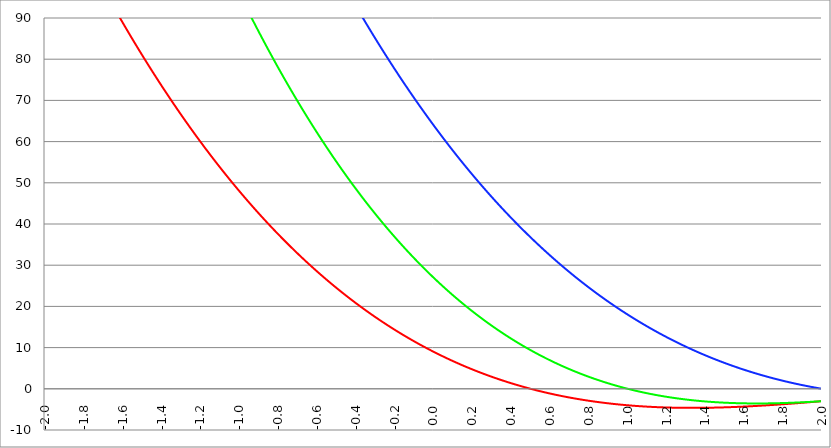
| Category | Series 1 | Series 0 | Series 2 |
|---|---|---|---|
| -2.0 | 125 | 225 | 288 |
| -1.998 | 124.8 | 224.67 | 287.664 |
| -1.996 | 124.6 | 224.341 | 287.329 |
| -1.994 | 124.401 | 224.011 | 286.993 |
| -1.992 | 124.202 | 223.682 | 286.658 |
| -1.99 | 124.002 | 223.354 | 286.323 |
| -1.988 | 123.804 | 223.026 | 285.989 |
| -1.986 | 123.605 | 222.698 | 285.654 |
| -1.984 | 123.406 | 222.37 | 285.32 |
| -1.982 | 123.208 | 222.043 | 284.986 |
| -1.98 | 123.01 | 221.716 | 284.653 |
| -1.978 | 122.812 | 221.389 | 284.319 |
| -1.976 | 122.614 | 221.062 | 283.986 |
| -1.974 | 122.417 | 220.736 | 283.654 |
| -1.972 | 122.22 | 220.411 | 283.321 |
| -1.97 | 122.022 | 220.085 | 282.989 |
| -1.968 | 121.826 | 219.76 | 282.657 |
| -1.966 | 121.629 | 219.435 | 282.325 |
| -1.964 | 121.432 | 219.11 | 281.993 |
| -1.962 | 121.236 | 218.786 | 281.662 |
| -1.96 | 121.04 | 218.462 | 281.331 |
| -1.958 | 120.844 | 218.139 | 281 |
| -1.956 | 120.648 | 217.815 | 280.67 |
| -1.954 | 120.453 | 217.492 | 280.34 |
| -1.952 | 120.257 | 217.17 | 280.01 |
| -1.95 | 120.062 | 216.847 | 279.68 |
| -1.948 | 119.867 | 216.525 | 279.35 |
| -1.946 | 119.673 | 216.203 | 279.021 |
| -1.944 | 119.478 | 215.882 | 278.692 |
| -1.942 | 119.284 | 215.561 | 278.363 |
| -1.94 | 119.09 | 215.24 | 278.035 |
| -1.938 | 118.896 | 214.919 | 277.707 |
| -1.936 | 118.702 | 214.599 | 277.379 |
| -1.934 | 118.508 | 214.279 | 277.051 |
| -1.932 | 118.315 | 213.959 | 276.723 |
| -1.93 | 118.122 | 213.64 | 276.396 |
| -1.928 | 117.929 | 213.321 | 276.069 |
| -1.926 | 117.736 | 213.002 | 275.742 |
| -1.924 | 117.544 | 212.684 | 275.416 |
| -1.922 | 117.351 | 212.366 | 275.09 |
| -1.92 | 117.159 | 212.048 | 274.764 |
| -1.918 | 116.967 | 211.731 | 274.438 |
| -1.916 | 116.775 | 211.413 | 274.113 |
| -1.914 | 116.584 | 211.097 | 273.787 |
| -1.912 | 116.392 | 210.78 | 273.462 |
| -1.91 | 116.201 | 210.464 | 273.138 |
| -1.908 | 116.01 | 210.148 | 272.813 |
| -1.906 | 115.819 | 209.832 | 272.489 |
| -1.904 | 115.629 | 209.517 | 272.165 |
| -1.902 | 115.438 | 209.202 | 271.841 |
| -1.9 | 115.248 | 208.887 | 271.518 |
| -1.898 | 115.058 | 208.573 | 271.195 |
| -1.896 | 114.868 | 208.258 | 270.872 |
| -1.894 | 114.679 | 207.945 | 270.549 |
| -1.892 | 114.489 | 207.631 | 270.227 |
| -1.89 | 114.3 | 207.318 | 269.905 |
| -1.888 | 114.111 | 207.005 | 269.583 |
| -1.886 | 113.922 | 206.692 | 269.261 |
| -1.884 | 113.733 | 206.38 | 268.939 |
| -1.882 | 113.545 | 206.068 | 268.618 |
| -1.88 | 113.357 | 205.756 | 268.297 |
| -1.878 | 113.168 | 205.445 | 267.977 |
| -1.876 | 112.981 | 205.134 | 267.656 |
| -1.874 | 112.793 | 204.823 | 267.336 |
| -1.872 | 112.605 | 204.513 | 267.016 |
| -1.87 | 112.418 | 204.203 | 266.696 |
| -1.868 | 112.231 | 203.893 | 266.377 |
| -1.866 | 112.044 | 203.583 | 266.058 |
| -1.864 | 111.857 | 203.274 | 265.739 |
| -1.862 | 111.671 | 202.965 | 265.42 |
| -1.86 | 111.485 | 202.656 | 265.102 |
| -1.858 | 111.298 | 202.348 | 264.784 |
| -1.856 | 111.112 | 202.04 | 264.466 |
| -1.854 | 110.927 | 201.732 | 264.148 |
| -1.852 | 110.741 | 201.425 | 263.83 |
| -1.85 | 110.556 | 201.117 | 263.513 |
| -1.848 | 110.371 | 200.811 | 263.196 |
| -1.846 | 110.186 | 200.504 | 262.88 |
| -1.844 | 110.001 | 200.198 | 262.563 |
| -1.842 | 109.816 | 199.892 | 262.247 |
| -1.84 | 109.632 | 199.586 | 261.931 |
| -1.838 | 109.448 | 199.281 | 261.615 |
| -1.836 | 109.264 | 198.976 | 261.3 |
| -1.834 | 109.08 | 198.671 | 260.985 |
| -1.832 | 108.896 | 198.367 | 260.67 |
| -1.83 | 108.713 | 198.062 | 260.355 |
| -1.828 | 108.529 | 197.759 | 260.041 |
| -1.826 | 108.346 | 197.455 | 259.726 |
| -1.824 | 108.163 | 197.152 | 259.412 |
| -1.822 | 107.981 | 196.849 | 259.099 |
| -1.82 | 107.798 | 196.546 | 258.785 |
| -1.818 | 107.616 | 196.244 | 258.472 |
| -1.816 | 107.434 | 195.942 | 258.159 |
| -1.814 | 107.252 | 195.64 | 257.846 |
| -1.812 | 107.07 | 195.338 | 257.534 |
| -1.81 | 106.889 | 195.037 | 257.221 |
| -1.808 | 106.707 | 194.736 | 256.909 |
| -1.806 | 106.526 | 194.436 | 256.598 |
| -1.804 | 106.345 | 194.136 | 256.286 |
| -1.802 | 106.165 | 193.836 | 255.975 |
| -1.8 | 105.984 | 193.536 | 255.664 |
| -1.798 | 105.804 | 193.237 | 255.353 |
| -1.796 | 105.623 | 192.938 | 255.043 |
| -1.794 | 105.443 | 192.639 | 254.732 |
| -1.792 | 105.264 | 192.34 | 254.422 |
| -1.79 | 105.084 | 192.042 | 254.113 |
| -1.788 | 104.905 | 191.744 | 253.803 |
| -1.786 | 104.725 | 191.447 | 253.494 |
| -1.784 | 104.546 | 191.149 | 253.185 |
| -1.782 | 104.367 | 190.852 | 252.876 |
| -1.78 | 104.189 | 190.556 | 252.568 |
| -1.778 | 104.01 | 190.259 | 252.259 |
| -1.776 | 103.832 | 189.963 | 251.951 |
| -1.774 | 103.654 | 189.667 | 251.643 |
| -1.772 | 103.476 | 189.372 | 251.336 |
| -1.77 | 103.298 | 189.077 | 251.028 |
| -1.768 | 103.121 | 188.782 | 250.721 |
| -1.766 | 102.943 | 188.487 | 250.415 |
| -1.764 | 102.766 | 188.193 | 250.108 |
| -1.762 | 102.589 | 187.899 | 249.802 |
| -1.76 | 102.412 | 187.605 | 249.496 |
| -1.758 | 102.236 | 187.311 | 249.19 |
| -1.756 | 102.059 | 187.018 | 248.884 |
| -1.754 | 101.883 | 186.725 | 248.579 |
| -1.752 | 101.707 | 186.433 | 248.274 |
| -1.75 | 101.531 | 186.141 | 247.969 |
| -1.748 | 101.356 | 185.849 | 247.664 |
| -1.746 | 101.18 | 185.557 | 247.36 |
| -1.744 | 101.005 | 185.266 | 247.056 |
| -1.742 | 100.83 | 184.974 | 246.752 |
| -1.74 | 100.655 | 184.684 | 246.448 |
| -1.738 | 100.48 | 184.393 | 246.145 |
| -1.736 | 100.306 | 184.103 | 245.841 |
| -1.734 | 100.131 | 183.813 | 245.539 |
| -1.732 | 99.957 | 183.523 | 245.236 |
| -1.73 | 99.783 | 183.234 | 244.933 |
| -1.728 | 99.609 | 182.945 | 244.631 |
| -1.726 | 99.436 | 182.656 | 244.329 |
| -1.724 | 99.262 | 182.368 | 244.028 |
| -1.722 | 99.089 | 182.08 | 243.726 |
| -1.72 | 98.916 | 181.792 | 243.425 |
| -1.718 | 98.743 | 181.504 | 243.124 |
| -1.716 | 98.571 | 181.217 | 242.823 |
| -1.714 | 98.398 | 180.93 | 242.523 |
| -1.712 | 98.226 | 180.643 | 242.222 |
| -1.71 | 98.054 | 180.357 | 241.922 |
| -1.708 | 97.882 | 180.071 | 241.623 |
| -1.706 | 97.71 | 179.785 | 241.323 |
| -1.704 | 97.539 | 179.499 | 241.024 |
| -1.702 | 97.367 | 179.214 | 240.725 |
| -1.7 | 97.196 | 178.929 | 240.426 |
| -1.698 | 97.025 | 178.644 | 240.127 |
| -1.696 | 96.854 | 178.36 | 239.829 |
| -1.694 | 96.684 | 178.076 | 239.531 |
| -1.692 | 96.513 | 177.792 | 239.233 |
| -1.69 | 96.343 | 177.509 | 238.936 |
| -1.688 | 96.173 | 177.225 | 238.638 |
| -1.686 | 96.003 | 176.942 | 238.341 |
| -1.684 | 95.833 | 176.66 | 238.044 |
| -1.682 | 95.664 | 176.377 | 237.748 |
| -1.68 | 95.494 | 176.095 | 237.451 |
| -1.678 | 95.325 | 175.814 | 237.155 |
| -1.676 | 95.156 | 175.532 | 236.859 |
| -1.674 | 94.988 | 175.251 | 236.564 |
| -1.672 | 94.819 | 174.97 | 236.268 |
| -1.67 | 94.651 | 174.689 | 235.973 |
| -1.668 | 94.482 | 174.409 | 235.678 |
| -1.666 | 94.314 | 174.129 | 235.383 |
| -1.664 | 94.147 | 173.849 | 235.089 |
| -1.662 | 93.979 | 173.57 | 234.795 |
| -1.66 | 93.811 | 173.29 | 234.501 |
| -1.658 | 93.644 | 173.012 | 234.207 |
| -1.656 | 93.477 | 172.733 | 233.913 |
| -1.654 | 93.31 | 172.455 | 233.62 |
| -1.652 | 93.143 | 172.177 | 233.327 |
| -1.65 | 92.977 | 171.899 | 233.034 |
| -1.648 | 92.81 | 171.621 | 232.742 |
| -1.646 | 92.644 | 171.344 | 232.449 |
| -1.644 | 92.478 | 171.067 | 232.157 |
| -1.642 | 92.312 | 170.791 | 231.865 |
| -1.64 | 92.147 | 170.514 | 231.574 |
| -1.638 | 91.981 | 170.238 | 231.283 |
| -1.636 | 91.816 | 169.963 | 230.991 |
| -1.634 | 91.651 | 169.687 | 230.701 |
| -1.632 | 91.486 | 169.412 | 230.41 |
| -1.63 | 91.321 | 169.137 | 230.119 |
| -1.628 | 91.157 | 168.863 | 229.829 |
| -1.626 | 90.992 | 168.588 | 229.539 |
| -1.624 | 90.828 | 168.314 | 229.25 |
| -1.622 | 90.664 | 168.04 | 228.96 |
| -1.62 | 90.5 | 167.767 | 228.671 |
| -1.618 | 90.337 | 167.494 | 228.382 |
| -1.616 | 90.173 | 167.221 | 228.093 |
| -1.614 | 90.01 | 166.948 | 227.805 |
| -1.612 | 89.847 | 166.676 | 227.517 |
| -1.61 | 89.684 | 166.404 | 227.229 |
| -1.608 | 89.521 | 166.132 | 226.941 |
| -1.606 | 89.359 | 165.861 | 226.653 |
| -1.604 | 89.196 | 165.59 | 226.366 |
| -1.602 | 89.034 | 165.319 | 226.079 |
| -1.6 | 88.872 | 165.048 | 225.792 |
| -1.598 | 88.71 | 164.778 | 225.505 |
| -1.596 | 88.549 | 164.508 | 225.219 |
| -1.594 | 88.387 | 164.238 | 224.933 |
| -1.592 | 88.226 | 163.968 | 224.647 |
| -1.59 | 88.065 | 163.699 | 224.361 |
| -1.588 | 87.904 | 163.43 | 224.076 |
| -1.586 | 87.743 | 163.162 | 223.791 |
| -1.584 | 87.582 | 162.893 | 223.506 |
| -1.582 | 87.422 | 162.625 | 223.221 |
| -1.58 | 87.262 | 162.357 | 222.937 |
| -1.578 | 87.102 | 162.09 | 222.652 |
| -1.576 | 86.942 | 161.823 | 222.368 |
| -1.574 | 86.782 | 161.556 | 222.085 |
| -1.572 | 86.623 | 161.289 | 221.801 |
| -1.57 | 86.463 | 161.023 | 221.518 |
| -1.568 | 86.304 | 160.756 | 221.235 |
| -1.566 | 86.145 | 160.491 | 220.952 |
| -1.564 | 85.987 | 160.225 | 220.669 |
| -1.562 | 85.828 | 159.96 | 220.387 |
| -1.56 | 85.67 | 159.695 | 220.105 |
| -1.558 | 85.511 | 159.43 | 219.823 |
| -1.556 | 85.353 | 159.166 | 219.541 |
| -1.554 | 85.195 | 158.902 | 219.26 |
| -1.552 | 85.038 | 158.638 | 218.979 |
| -1.55 | 84.88 | 158.374 | 218.698 |
| -1.548 | 84.723 | 158.111 | 218.417 |
| -1.546 | 84.566 | 157.848 | 218.137 |
| -1.544 | 84.409 | 157.585 | 217.856 |
| -1.542 | 84.252 | 157.323 | 217.576 |
| -1.54 | 84.095 | 157.06 | 217.297 |
| -1.538 | 83.939 | 156.798 | 217.017 |
| -1.536 | 83.783 | 156.537 | 216.738 |
| -1.534 | 83.627 | 156.275 | 216.459 |
| -1.532 | 83.471 | 156.014 | 216.18 |
| -1.53 | 83.315 | 155.754 | 215.901 |
| -1.528 | 83.159 | 155.493 | 215.623 |
| -1.526 | 83.004 | 155.233 | 215.345 |
| -1.524 | 82.849 | 154.973 | 215.067 |
| -1.522 | 82.694 | 154.713 | 214.789 |
| -1.52 | 82.539 | 154.454 | 214.512 |
| -1.518 | 82.384 | 154.195 | 214.234 |
| -1.516 | 82.23 | 153.936 | 213.957 |
| -1.514 | 82.075 | 153.677 | 213.681 |
| -1.512 | 81.921 | 153.419 | 213.404 |
| -1.51 | 81.767 | 153.161 | 213.128 |
| -1.508 | 81.613 | 152.903 | 212.852 |
| -1.506 | 81.46 | 152.646 | 212.576 |
| -1.504 | 81.306 | 152.389 | 212.3 |
| -1.502 | 81.153 | 152.132 | 212.025 |
| -1.5 | 81 | 151.875 | 211.75 |
| -1.498 | 80.847 | 151.619 | 211.475 |
| -1.496 | 80.694 | 151.363 | 211.2 |
| -1.494 | 80.542 | 151.107 | 210.926 |
| -1.492 | 80.389 | 150.851 | 210.652 |
| -1.49 | 80.237 | 150.596 | 210.378 |
| -1.488 | 80.085 | 150.341 | 210.104 |
| -1.486 | 79.933 | 150.086 | 209.831 |
| -1.484 | 79.782 | 149.832 | 209.557 |
| -1.482 | 79.63 | 149.578 | 209.284 |
| -1.48 | 79.479 | 149.324 | 209.012 |
| -1.478 | 79.328 | 149.07 | 208.739 |
| -1.476 | 79.177 | 148.817 | 208.467 |
| -1.474 | 79.026 | 148.564 | 208.195 |
| -1.472 | 78.875 | 148.311 | 207.923 |
| -1.469999999999999 | 78.725 | 148.058 | 207.651 |
| -1.467999999999999 | 78.574 | 147.806 | 207.38 |
| -1.465999999999999 | 78.424 | 147.554 | 207.108 |
| -1.463999999999999 | 78.274 | 147.303 | 206.837 |
| -1.461999999999999 | 78.125 | 147.051 | 206.567 |
| -1.459999999999999 | 77.975 | 146.8 | 206.296 |
| -1.457999999999999 | 77.826 | 146.549 | 206.026 |
| -1.455999999999999 | 77.676 | 146.299 | 205.756 |
| -1.453999999999999 | 77.527 | 146.048 | 205.486 |
| -1.451999999999999 | 77.378 | 145.798 | 205.217 |
| -1.449999999999999 | 77.23 | 145.548 | 204.947 |
| -1.447999999999999 | 77.081 | 145.299 | 204.678 |
| -1.445999999999999 | 76.933 | 145.05 | 204.409 |
| -1.443999999999999 | 76.785 | 144.801 | 204.141 |
| -1.441999999999999 | 76.637 | 144.552 | 203.872 |
| -1.439999999999999 | 76.489 | 144.304 | 203.604 |
| -1.437999999999999 | 76.341 | 144.055 | 203.336 |
| -1.435999999999999 | 76.194 | 143.808 | 203.068 |
| -1.433999999999999 | 76.046 | 143.56 | 202.801 |
| -1.431999999999999 | 75.899 | 143.313 | 202.533 |
| -1.429999999999999 | 75.752 | 143.066 | 202.266 |
| -1.427999999999999 | 75.605 | 142.819 | 202 |
| -1.425999999999999 | 75.459 | 142.572 | 201.733 |
| -1.423999999999999 | 75.312 | 142.326 | 201.467 |
| -1.421999999999999 | 75.166 | 142.08 | 201.2 |
| -1.419999999999999 | 75.02 | 141.834 | 200.935 |
| -1.417999999999999 | 74.874 | 141.589 | 200.669 |
| -1.415999999999999 | 74.728 | 141.344 | 200.403 |
| -1.413999999999999 | 74.582 | 141.099 | 200.138 |
| -1.411999999999999 | 74.437 | 140.854 | 199.873 |
| -1.409999999999999 | 74.292 | 140.61 | 199.608 |
| -1.407999999999999 | 74.147 | 140.366 | 199.344 |
| -1.405999999999999 | 74.002 | 140.122 | 199.08 |
| -1.403999999999999 | 73.857 | 139.878 | 198.815 |
| -1.401999999999999 | 73.712 | 139.635 | 198.552 |
| -1.399999999999999 | 73.568 | 139.392 | 198.288 |
| -1.397999999999999 | 73.424 | 139.149 | 198.025 |
| -1.395999999999999 | 73.28 | 138.907 | 197.761 |
| -1.393999999999999 | 73.136 | 138.665 | 197.498 |
| -1.391999999999999 | 72.992 | 138.423 | 197.236 |
| -1.389999999999999 | 72.849 | 138.181 | 196.973 |
| -1.387999999999999 | 72.705 | 137.94 | 196.711 |
| -1.385999999999999 | 72.562 | 137.698 | 196.449 |
| -1.383999999999999 | 72.419 | 137.458 | 196.187 |
| -1.381999999999999 | 72.276 | 137.217 | 195.926 |
| -1.379999999999999 | 72.133 | 136.977 | 195.664 |
| -1.377999999999999 | 71.991 | 136.737 | 195.403 |
| -1.375999999999999 | 71.848 | 136.497 | 195.142 |
| -1.373999999999999 | 71.706 | 136.257 | 194.881 |
| -1.371999999999999 | 71.564 | 136.018 | 194.621 |
| -1.369999999999999 | 71.422 | 135.779 | 194.361 |
| -1.367999999999999 | 71.281 | 135.54 | 194.101 |
| -1.365999999999999 | 71.139 | 135.302 | 193.841 |
| -1.363999999999999 | 70.998 | 135.064 | 193.581 |
| -1.361999999999999 | 70.857 | 134.826 | 193.322 |
| -1.359999999999999 | 70.716 | 134.588 | 193.063 |
| -1.357999999999999 | 70.575 | 134.351 | 192.804 |
| -1.355999999999999 | 70.434 | 134.113 | 192.545 |
| -1.353999999999999 | 70.294 | 133.877 | 192.287 |
| -1.351999999999999 | 70.153 | 133.64 | 192.029 |
| -1.349999999999999 | 70.013 | 133.404 | 191.771 |
| -1.347999999999999 | 69.873 | 133.168 | 191.513 |
| -1.345999999999999 | 69.733 | 132.932 | 191.255 |
| -1.343999999999999 | 69.594 | 132.696 | 190.998 |
| -1.341999999999999 | 69.454 | 132.461 | 190.741 |
| -1.339999999999999 | 69.315 | 132.226 | 190.484 |
| -1.337999999999999 | 69.176 | 131.991 | 190.228 |
| -1.335999999999999 | 69.037 | 131.757 | 189.971 |
| -1.333999999999999 | 68.898 | 131.522 | 189.715 |
| -1.331999999999999 | 68.759 | 131.289 | 189.459 |
| -1.329999999999999 | 68.621 | 131.055 | 189.203 |
| -1.327999999999999 | 68.483 | 130.821 | 188.948 |
| -1.325999999999999 | 68.345 | 130.588 | 188.692 |
| -1.323999999999999 | 68.207 | 130.355 | 188.437 |
| -1.321999999999999 | 68.069 | 130.123 | 188.183 |
| -1.319999999999999 | 67.931 | 129.89 | 187.928 |
| -1.317999999999999 | 67.794 | 129.658 | 187.674 |
| -1.315999999999999 | 67.656 | 129.426 | 187.419 |
| -1.313999999999999 | 67.519 | 129.195 | 187.165 |
| -1.311999999999999 | 67.382 | 128.963 | 186.912 |
| -1.309999999999999 | 67.245 | 128.732 | 186.658 |
| -1.307999999999999 | 67.109 | 128.502 | 186.405 |
| -1.305999999999999 | 66.972 | 128.271 | 186.152 |
| -1.303999999999999 | 66.836 | 128.041 | 185.899 |
| -1.301999999999999 | 66.7 | 127.811 | 185.646 |
| -1.299999999999999 | 66.564 | 127.581 | 185.394 |
| -1.297999999999999 | 66.428 | 127.352 | 185.142 |
| -1.295999999999999 | 66.293 | 127.122 | 184.89 |
| -1.293999999999999 | 66.157 | 126.893 | 184.638 |
| -1.291999999999999 | 66.022 | 126.665 | 184.387 |
| -1.289999999999999 | 65.887 | 126.436 | 184.135 |
| -1.287999999999999 | 65.752 | 126.208 | 183.884 |
| -1.285999999999999 | 65.617 | 125.98 | 183.633 |
| -1.283999999999999 | 65.482 | 125.752 | 183.383 |
| -1.281999999999999 | 65.348 | 125.525 | 183.132 |
| -1.279999999999999 | 65.214 | 125.298 | 182.882 |
| -1.277999999999999 | 65.079 | 125.071 | 182.632 |
| -1.275999999999999 | 64.945 | 124.844 | 182.383 |
| -1.273999999999999 | 64.812 | 124.618 | 182.133 |
| -1.271999999999999 | 64.678 | 124.392 | 181.884 |
| -1.269999999999999 | 64.544 | 124.166 | 181.635 |
| -1.267999999999999 | 64.411 | 123.94 | 181.386 |
| -1.265999999999999 | 64.278 | 123.715 | 181.137 |
| -1.263999999999999 | 64.145 | 123.49 | 180.889 |
| -1.261999999999999 | 64.012 | 123.265 | 180.641 |
| -1.259999999999999 | 63.88 | 123.041 | 180.393 |
| -1.257999999999999 | 63.747 | 122.816 | 180.145 |
| -1.255999999999999 | 63.615 | 122.592 | 179.897 |
| -1.253999999999999 | 63.483 | 122.369 | 179.65 |
| -1.251999999999999 | 63.351 | 122.145 | 179.403 |
| -1.249999999999999 | 63.219 | 121.922 | 179.156 |
| -1.247999999999999 | 63.087 | 121.699 | 178.91 |
| -1.245999999999999 | 62.956 | 121.476 | 178.663 |
| -1.243999999999999 | 62.824 | 121.254 | 178.417 |
| -1.241999999999999 | 62.693 | 121.031 | 178.171 |
| -1.239999999999999 | 62.562 | 120.809 | 177.925 |
| -1.237999999999999 | 62.431 | 120.588 | 177.68 |
| -1.235999999999999 | 62.301 | 120.366 | 177.434 |
| -1.233999999999999 | 62.17 | 120.145 | 177.189 |
| -1.231999999999999 | 62.04 | 119.924 | 176.944 |
| -1.229999999999999 | 61.909 | 119.704 | 176.7 |
| -1.227999999999999 | 61.779 | 119.483 | 176.455 |
| -1.225999999999999 | 61.65 | 119.263 | 176.211 |
| -1.223999999999999 | 61.52 | 119.043 | 175.967 |
| -1.221999999999999 | 61.39 | 118.823 | 175.723 |
| -1.219999999999999 | 61.261 | 118.604 | 175.48 |
| -1.217999999999999 | 61.132 | 118.385 | 175.236 |
| -1.215999999999999 | 61.003 | 118.166 | 174.993 |
| -1.213999999999999 | 60.874 | 117.947 | 174.75 |
| -1.211999999999999 | 60.745 | 117.729 | 174.508 |
| -1.209999999999999 | 60.616 | 117.511 | 174.265 |
| -1.207999999999999 | 60.488 | 117.293 | 174.023 |
| -1.205999999999999 | 60.36 | 117.075 | 173.781 |
| -1.203999999999999 | 60.232 | 116.858 | 173.539 |
| -1.201999999999999 | 60.104 | 116.641 | 173.297 |
| -1.199999999999999 | 59.976 | 116.424 | 173.056 |
| -1.197999999999999 | 59.848 | 116.207 | 172.815 |
| -1.195999999999999 | 59.721 | 115.991 | 172.574 |
| -1.193999999999999 | 59.594 | 115.775 | 172.333 |
| -1.191999999999999 | 59.467 | 115.559 | 172.093 |
| -1.189999999999999 | 59.34 | 115.344 | 171.852 |
| -1.187999999999999 | 59.213 | 115.128 | 171.612 |
| -1.185999999999999 | 59.086 | 114.913 | 171.372 |
| -1.183999999999999 | 58.96 | 114.698 | 171.133 |
| -1.181999999999999 | 58.833 | 114.484 | 170.893 |
| -1.179999999999999 | 58.707 | 114.269 | 170.654 |
| -1.177999999999999 | 58.581 | 114.055 | 170.415 |
| -1.175999999999999 | 58.455 | 113.842 | 170.176 |
| -1.173999999999999 | 58.33 | 113.628 | 169.938 |
| -1.171999999999999 | 58.204 | 113.415 | 169.699 |
| -1.169999999999999 | 58.079 | 113.202 | 169.461 |
| -1.167999999999999 | 57.954 | 112.989 | 169.223 |
| -1.165999999999999 | 57.829 | 112.776 | 168.986 |
| -1.163999999999999 | 57.704 | 112.564 | 168.748 |
| -1.161999999999999 | 57.579 | 112.352 | 168.511 |
| -1.159999999999999 | 57.455 | 112.14 | 168.274 |
| -1.157999999999999 | 57.33 | 111.929 | 168.037 |
| -1.155999999999999 | 57.206 | 111.717 | 167.8 |
| -1.153999999999999 | 57.082 | 111.506 | 167.564 |
| -1.151999999999999 | 56.958 | 111.296 | 167.328 |
| -1.149999999999999 | 56.834 | 111.085 | 167.092 |
| -1.147999999999999 | 56.711 | 110.875 | 166.856 |
| -1.145999999999999 | 56.587 | 110.665 | 166.62 |
| -1.143999999999999 | 56.464 | 110.455 | 166.385 |
| -1.141999999999999 | 56.341 | 110.246 | 166.15 |
| -1.139999999999999 | 56.218 | 110.036 | 165.915 |
| -1.137999999999999 | 56.095 | 109.827 | 165.68 |
| -1.135999999999999 | 55.972 | 109.618 | 165.446 |
| -1.133999999999999 | 55.85 | 109.41 | 165.212 |
| -1.131999999999999 | 55.728 | 109.202 | 164.978 |
| -1.129999999999999 | 55.605 | 108.994 | 164.744 |
| -1.127999999999999 | 55.483 | 108.786 | 164.51 |
| -1.125999999999999 | 55.362 | 108.578 | 164.277 |
| -1.123999999999999 | 55.24 | 108.371 | 164.044 |
| -1.121999999999999 | 55.118 | 108.164 | 163.811 |
| -1.119999999999999 | 54.997 | 107.957 | 163.578 |
| -1.117999999999999 | 54.876 | 107.751 | 163.345 |
| -1.115999999999999 | 54.755 | 107.544 | 163.113 |
| -1.113999999999999 | 54.634 | 107.338 | 162.881 |
| -1.111999999999999 | 54.513 | 107.133 | 162.649 |
| -1.109999999999999 | 54.393 | 106.927 | 162.417 |
| -1.107999999999999 | 54.272 | 106.722 | 162.186 |
| -1.105999999999999 | 54.152 | 106.517 | 161.955 |
| -1.103999999999999 | 54.032 | 106.312 | 161.723 |
| -1.101999999999999 | 53.912 | 106.107 | 161.493 |
| -1.099999999999999 | 53.792 | 105.903 | 161.262 |
| -1.097999999999999 | 53.672 | 105.699 | 161.032 |
| -1.095999999999999 | 53.553 | 105.495 | 160.801 |
| -1.093999999999999 | 53.434 | 105.292 | 160.571 |
| -1.091999999999999 | 53.314 | 105.088 | 160.342 |
| -1.089999999999999 | 53.195 | 104.885 | 160.112 |
| -1.087999999999999 | 53.076 | 104.682 | 159.883 |
| -1.085999999999999 | 52.958 | 104.48 | 159.654 |
| -1.083999999999999 | 52.839 | 104.277 | 159.425 |
| -1.081999999999999 | 52.721 | 104.075 | 159.196 |
| -1.079999999999999 | 52.603 | 103.874 | 158.967 |
| -1.077999999999999 | 52.485 | 103.672 | 158.739 |
| -1.075999999999999 | 52.367 | 103.471 | 158.511 |
| -1.073999999999999 | 52.249 | 103.269 | 158.283 |
| -1.071999999999999 | 52.131 | 103.069 | 158.056 |
| -1.069999999999999 | 52.014 | 102.868 | 157.828 |
| -1.067999999999999 | 51.896 | 102.668 | 157.601 |
| -1.065999999999999 | 51.779 | 102.468 | 157.374 |
| -1.063999999999999 | 51.662 | 102.268 | 157.147 |
| -1.061999999999999 | 51.546 | 102.068 | 156.92 |
| -1.059999999999999 | 51.429 | 101.869 | 156.694 |
| -1.057999999999999 | 51.312 | 101.67 | 156.468 |
| -1.055999999999999 | 51.196 | 101.471 | 156.242 |
| -1.053999999999999 | 51.08 | 101.272 | 156.016 |
| -1.051999999999999 | 50.964 | 101.074 | 155.791 |
| -1.049999999999999 | 50.848 | 100.875 | 155.565 |
| -1.047999999999999 | 50.732 | 100.677 | 155.34 |
| -1.045999999999999 | 50.616 | 100.48 | 155.115 |
| -1.043999999999999 | 50.501 | 100.282 | 154.891 |
| -1.041999999999999 | 50.386 | 100.085 | 154.666 |
| -1.039999999999999 | 50.271 | 99.888 | 154.442 |
| -1.037999999999999 | 50.156 | 99.691 | 154.218 |
| -1.035999999999999 | 50.041 | 99.495 | 153.994 |
| -1.033999999999999 | 49.926 | 99.299 | 153.77 |
| -1.031999999999999 | 49.812 | 99.103 | 153.547 |
| -1.029999999999999 | 49.697 | 98.907 | 153.323 |
| -1.027999999999999 | 49.583 | 98.712 | 153.1 |
| -1.025999999999999 | 49.469 | 98.516 | 152.878 |
| -1.023999999999999 | 49.355 | 98.321 | 152.655 |
| -1.021999999999999 | 49.241 | 98.127 | 152.433 |
| -1.019999999999999 | 49.128 | 97.932 | 152.21 |
| -1.017999999999999 | 49.014 | 97.738 | 151.988 |
| -1.015999999999999 | 48.901 | 97.544 | 151.767 |
| -1.013999999999999 | 48.788 | 97.35 | 151.545 |
| -1.011999999999999 | 48.675 | 97.156 | 151.324 |
| -1.009999999999999 | 48.562 | 96.963 | 151.103 |
| -1.007999999999999 | 48.449 | 96.77 | 150.882 |
| -1.005999999999999 | 48.337 | 96.577 | 150.661 |
| -1.003999999999999 | 48.224 | 96.384 | 150.44 |
| -1.001999999999999 | 48.112 | 96.192 | 150.22 |
| -0.999999999999999 | 48 | 96 | 150 |
| -0.997999999999999 | 47.888 | 95.808 | 149.78 |
| -0.995999999999999 | 47.776 | 95.616 | 149.56 |
| -0.993999999999999 | 47.665 | 95.425 | 149.341 |
| -0.991999999999999 | 47.553 | 95.234 | 149.122 |
| -0.989999999999999 | 47.442 | 95.043 | 148.903 |
| -0.987999999999999 | 47.331 | 94.852 | 148.684 |
| -0.985999999999999 | 47.22 | 94.662 | 148.465 |
| -0.983999999999999 | 47.109 | 94.472 | 148.247 |
| -0.981999999999999 | 46.998 | 94.282 | 148.028 |
| -0.979999999999999 | 46.888 | 94.092 | 147.81 |
| -0.977999999999999 | 46.777 | 93.902 | 147.593 |
| -0.975999999999999 | 46.667 | 93.713 | 147.375 |
| -0.973999999999999 | 46.557 | 93.524 | 147.158 |
| -0.971999999999999 | 46.447 | 93.335 | 146.94 |
| -0.969999999999999 | 46.337 | 93.147 | 146.723 |
| -0.967999999999999 | 46.227 | 92.959 | 146.507 |
| -0.965999999999999 | 46.118 | 92.771 | 146.29 |
| -0.963999999999999 | 46.009 | 92.583 | 146.074 |
| -0.961999999999999 | 45.899 | 92.395 | 145.857 |
| -0.959999999999999 | 45.79 | 92.208 | 145.641 |
| -0.957999999999999 | 45.681 | 92.021 | 145.426 |
| -0.955999999999999 | 45.573 | 91.834 | 145.21 |
| -0.953999999999999 | 45.464 | 91.647 | 144.995 |
| -0.951999999999999 | 45.356 | 91.461 | 144.78 |
| -0.949999999999999 | 45.247 | 91.275 | 144.565 |
| -0.947999999999999 | 45.139 | 91.089 | 144.35 |
| -0.945999999999999 | 45.031 | 90.903 | 144.136 |
| -0.943999999999999 | 44.923 | 90.718 | 143.921 |
| -0.941999999999999 | 44.816 | 90.532 | 143.707 |
| -0.939999999999999 | 44.708 | 90.347 | 143.493 |
| -0.937999999999999 | 44.601 | 90.163 | 143.279 |
| -0.935999999999999 | 44.493 | 89.978 | 143.066 |
| -0.933999999999999 | 44.386 | 89.794 | 142.853 |
| -0.931999999999999 | 44.279 | 89.61 | 142.64 |
| -0.929999999999999 | 44.172 | 89.426 | 142.427 |
| -0.927999999999999 | 44.066 | 89.242 | 142.214 |
| -0.925999999999999 | 43.959 | 89.059 | 142.002 |
| -0.923999999999999 | 43.853 | 88.876 | 141.789 |
| -0.921999999999999 | 43.747 | 88.693 | 141.577 |
| -0.919999999999999 | 43.641 | 88.51 | 141.365 |
| -0.917999999999999 | 43.535 | 88.328 | 141.154 |
| -0.915999999999999 | 43.429 | 88.146 | 140.942 |
| -0.913999999999999 | 43.323 | 87.964 | 140.731 |
| -0.911999999999999 | 43.218 | 87.782 | 140.52 |
| -0.909999999999999 | 43.112 | 87.601 | 140.309 |
| -0.907999999999999 | 43.007 | 87.42 | 140.099 |
| -0.905999999999999 | 42.902 | 87.239 | 139.888 |
| -0.903999999999999 | 42.797 | 87.058 | 139.678 |
| -0.901999999999999 | 42.693 | 86.877 | 139.468 |
| -0.899999999999999 | 42.588 | 86.697 | 139.258 |
| -0.897999999999999 | 42.484 | 86.517 | 139.048 |
| -0.895999999999999 | 42.379 | 86.337 | 138.839 |
| -0.893999999999999 | 42.275 | 86.158 | 138.63 |
| -0.891999999999999 | 42.171 | 85.978 | 138.421 |
| -0.889999999999999 | 42.067 | 85.799 | 138.212 |
| -0.887999999999999 | 41.964 | 85.62 | 138.003 |
| -0.885999999999999 | 41.86 | 85.441 | 137.795 |
| -0.883999999999999 | 41.757 | 85.263 | 137.587 |
| -0.881999999999999 | 41.653 | 85.085 | 137.379 |
| -0.879999999999999 | 41.55 | 84.907 | 137.171 |
| -0.877999999999999 | 41.447 | 84.729 | 136.963 |
| -0.875999999999999 | 41.344 | 84.552 | 136.756 |
| -0.873999999999999 | 41.242 | 84.374 | 136.549 |
| -0.871999999999999 | 41.139 | 84.197 | 136.342 |
| -0.869999999999999 | 41.037 | 84.02 | 136.135 |
| -0.867999999999999 | 40.934 | 83.844 | 135.928 |
| -0.865999999999999 | 40.832 | 83.667 | 135.722 |
| -0.863999999999999 | 40.73 | 83.491 | 135.516 |
| -0.861999999999999 | 40.629 | 83.315 | 135.31 |
| -0.859999999999999 | 40.527 | 83.14 | 135.104 |
| -0.857999999999999 | 40.425 | 82.964 | 134.899 |
| -0.855999999999999 | 40.324 | 82.789 | 134.693 |
| -0.853999999999999 | 40.223 | 82.614 | 134.488 |
| -0.851999999999999 | 40.122 | 82.439 | 134.283 |
| -0.849999999999999 | 40.021 | 82.265 | 134.078 |
| -0.847999999999999 | 39.92 | 82.091 | 133.874 |
| -0.845999999999999 | 39.819 | 81.917 | 133.669 |
| -0.843999999999999 | 39.719 | 81.743 | 133.465 |
| -0.841999999999999 | 39.618 | 81.569 | 133.261 |
| -0.839999999999999 | 39.518 | 81.396 | 133.057 |
| -0.837999999999999 | 39.418 | 81.223 | 132.854 |
| -0.835999999999999 | 39.318 | 81.05 | 132.65 |
| -0.833999999999999 | 39.218 | 80.877 | 132.447 |
| -0.831999999999999 | 39.119 | 80.704 | 132.244 |
| -0.829999999999999 | 39.019 | 80.532 | 132.042 |
| -0.827999999999999 | 38.92 | 80.36 | 131.839 |
| -0.825999999999999 | 38.821 | 80.188 | 131.637 |
| -0.823999999999999 | 38.722 | 80.017 | 131.434 |
| -0.821999999999999 | 38.623 | 79.846 | 131.233 |
| -0.819999999999999 | 38.524 | 79.675 | 131.031 |
| -0.817999999999999 | 38.425 | 79.504 | 130.829 |
| -0.815999999999999 | 38.327 | 79.333 | 130.628 |
| -0.813999999999999 | 38.228 | 79.163 | 130.427 |
| -0.811999999999999 | 38.13 | 78.992 | 130.226 |
| -0.809999999999999 | 38.032 | 78.822 | 130.025 |
| -0.807999999999999 | 37.934 | 78.653 | 129.824 |
| -0.805999999999999 | 37.836 | 78.483 | 129.624 |
| -0.803999999999999 | 37.739 | 78.314 | 129.424 |
| -0.801999999999999 | 37.641 | 78.145 | 129.224 |
| -0.799999999999999 | 37.544 | 77.976 | 129.024 |
| -0.797999999999999 | 37.447 | 77.807 | 128.824 |
| -0.795999999999999 | 37.35 | 77.639 | 128.625 |
| -0.793999999999999 | 37.253 | 77.471 | 128.426 |
| -0.791999999999999 | 37.156 | 77.303 | 128.227 |
| -0.789999999999999 | 37.059 | 77.135 | 128.028 |
| -0.787999999999999 | 36.963 | 76.968 | 127.829 |
| -0.785999999999999 | 36.867 | 76.8 | 127.631 |
| -0.783999999999999 | 36.77 | 76.633 | 127.433 |
| -0.781999999999999 | 36.674 | 76.467 | 127.235 |
| -0.779999999999999 | 36.578 | 76.3 | 127.037 |
| -0.777999999999999 | 36.483 | 76.134 | 126.84 |
| -0.775999999999999 | 36.387 | 75.968 | 126.642 |
| -0.773999999999999 | 36.291 | 75.802 | 126.445 |
| -0.771999999999999 | 36.196 | 75.636 | 126.248 |
| -0.769999999999999 | 36.101 | 75.47 | 126.051 |
| -0.767999999999999 | 36.006 | 75.305 | 125.854 |
| -0.765999999999999 | 35.911 | 75.14 | 125.658 |
| -0.763999999999999 | 35.816 | 74.975 | 125.462 |
| -0.761999999999999 | 35.721 | 74.811 | 125.266 |
| -0.759999999999999 | 35.627 | 74.647 | 125.07 |
| -0.757999999999999 | 35.532 | 74.482 | 124.874 |
| -0.755999999999999 | 35.438 | 74.318 | 124.679 |
| -0.753999999999999 | 35.344 | 74.155 | 124.484 |
| -0.751999999999999 | 35.25 | 73.991 | 124.289 |
| -0.749999999999999 | 35.156 | 73.828 | 124.094 |
| -0.747999999999999 | 35.063 | 73.665 | 123.899 |
| -0.745999999999999 | 34.969 | 73.502 | 123.705 |
| -0.743999999999999 | 34.876 | 73.34 | 123.51 |
| -0.741999999999999 | 34.782 | 73.177 | 123.316 |
| -0.739999999999999 | 34.689 | 73.015 | 123.122 |
| -0.737999999999999 | 34.596 | 72.853 | 122.929 |
| -0.735999999999999 | 34.503 | 72.692 | 122.735 |
| -0.733999999999999 | 34.411 | 72.53 | 122.542 |
| -0.731999999999999 | 34.318 | 72.369 | 122.349 |
| -0.729999999999999 | 34.226 | 72.208 | 122.156 |
| -0.727999999999999 | 34.133 | 72.047 | 121.963 |
| -0.725999999999999 | 34.041 | 71.887 | 121.771 |
| -0.723999999999999 | 33.949 | 71.726 | 121.579 |
| -0.721999999999999 | 33.857 | 71.566 | 121.386 |
| -0.719999999999999 | 33.766 | 71.406 | 121.194 |
| -0.717999999999999 | 33.674 | 71.246 | 121.003 |
| -0.715999999999999 | 33.583 | 71.087 | 120.811 |
| -0.713999999999999 | 33.491 | 70.928 | 120.62 |
| -0.711999999999999 | 33.4 | 70.769 | 120.429 |
| -0.709999999999999 | 33.309 | 70.61 | 120.238 |
| -0.707999999999999 | 33.218 | 70.451 | 120.047 |
| -0.705999999999999 | 33.127 | 70.293 | 119.857 |
| -0.703999999999999 | 33.037 | 70.135 | 119.666 |
| -0.701999999999999 | 32.946 | 69.977 | 119.476 |
| -0.699999999999999 | 32.856 | 69.819 | 119.286 |
| -0.697999999999999 | 32.766 | 69.661 | 119.096 |
| -0.695999999999999 | 32.676 | 69.504 | 118.907 |
| -0.693999999999999 | 32.586 | 69.347 | 118.717 |
| -0.691999999999999 | 32.496 | 69.19 | 118.528 |
| -0.689999999999999 | 32.406 | 69.034 | 118.339 |
| -0.687999999999999 | 32.317 | 68.877 | 118.15 |
| -0.685999999999999 | 32.227 | 68.721 | 117.962 |
| -0.683999999999999 | 32.138 | 68.565 | 117.773 |
| -0.681999999999999 | 32.049 | 68.409 | 117.585 |
| -0.679999999999999 | 31.96 | 68.254 | 117.397 |
| -0.677999999999999 | 31.871 | 68.098 | 117.209 |
| -0.675999999999999 | 31.783 | 67.943 | 117.021 |
| -0.673999999999999 | 31.694 | 67.788 | 116.834 |
| -0.671999999999999 | 31.606 | 67.634 | 116.647 |
| -0.669999999999999 | 31.517 | 67.479 | 116.46 |
| -0.667999999999999 | 31.429 | 67.325 | 116.273 |
| -0.665999999999999 | 31.341 | 67.171 | 116.086 |
| -0.663999999999999 | 31.253 | 67.017 | 115.899 |
| -0.661999999999999 | 31.165 | 66.863 | 115.713 |
| -0.659999999999999 | 31.078 | 66.71 | 115.527 |
| -0.657999999999999 | 30.99 | 66.557 | 115.341 |
| -0.655999999999999 | 30.903 | 66.404 | 115.155 |
| -0.653999999999999 | 30.816 | 66.251 | 114.97 |
| -0.651999999999999 | 30.729 | 66.099 | 114.784 |
| -0.649999999999999 | 30.642 | 65.946 | 114.599 |
| -0.647999999999999 | 30.555 | 65.794 | 114.414 |
| -0.645999999999999 | 30.468 | 65.642 | 114.229 |
| -0.643999999999999 | 30.382 | 65.491 | 114.045 |
| -0.641999999999999 | 30.295 | 65.339 | 113.86 |
| -0.639999999999999 | 30.209 | 65.188 | 113.676 |
| -0.637999999999999 | 30.123 | 65.037 | 113.492 |
| -0.635999999999999 | 30.037 | 64.886 | 113.308 |
| -0.633999999999999 | 29.951 | 64.736 | 113.125 |
| -0.631999999999999 | 29.865 | 64.585 | 112.941 |
| -0.629999999999999 | 29.78 | 64.435 | 112.758 |
| -0.627999999999999 | 29.694 | 64.285 | 112.575 |
| -0.625999999999999 | 29.609 | 64.135 | 112.392 |
| -0.623999999999999 | 29.524 | 63.986 | 112.209 |
| -0.621999999999999 | 29.439 | 63.836 | 112.027 |
| -0.619999999999999 | 29.354 | 63.687 | 111.845 |
| -0.617999999999999 | 29.269 | 63.538 | 111.663 |
| -0.615999999999999 | 29.184 | 63.39 | 111.481 |
| -0.613999999999999 | 29.1 | 63.241 | 111.299 |
| -0.611999999999999 | 29.016 | 63.093 | 111.117 |
| -0.609999999999999 | 28.931 | 62.945 | 110.936 |
| -0.607999999999999 | 28.847 | 62.797 | 110.755 |
| -0.605999999999999 | 28.763 | 62.65 | 110.574 |
| -0.603999999999999 | 28.679 | 62.502 | 110.393 |
| -0.601999999999999 | 28.596 | 62.355 | 110.212 |
| -0.599999999999999 | 28.512 | 62.208 | 110.032 |
| -0.597999999999999 | 28.429 | 62.061 | 109.852 |
| -0.595999999999999 | 28.345 | 61.915 | 109.672 |
| -0.593999999999999 | 28.262 | 61.768 | 109.492 |
| -0.591999999999999 | 28.179 | 61.622 | 109.312 |
| -0.589999999999999 | 28.096 | 61.476 | 109.133 |
| -0.587999999999999 | 28.013 | 61.331 | 108.953 |
| -0.585999999999999 | 27.931 | 61.185 | 108.774 |
| -0.583999999999999 | 27.848 | 61.04 | 108.595 |
| -0.581999999999999 | 27.766 | 60.895 | 108.417 |
| -0.579999999999999 | 27.683 | 60.75 | 108.238 |
| -0.577999999999999 | 27.601 | 60.605 | 108.06 |
| -0.575999999999999 | 27.519 | 60.461 | 107.882 |
| -0.573999999999999 | 27.437 | 60.316 | 107.704 |
| -0.571999999999999 | 27.356 | 60.172 | 107.526 |
| -0.569999999999999 | 27.274 | 60.028 | 107.348 |
| -0.567999999999999 | 27.193 | 59.885 | 107.171 |
| -0.565999999999999 | 27.111 | 59.741 | 106.994 |
| -0.563999999999999 | 27.03 | 59.598 | 106.817 |
| -0.561999999999999 | 26.949 | 59.455 | 106.64 |
| -0.559999999999999 | 26.868 | 59.312 | 106.463 |
| -0.557999999999999 | 26.787 | 59.17 | 106.287 |
| -0.555999999999999 | 26.707 | 59.027 | 106.11 |
| -0.553999999999999 | 26.626 | 58.885 | 105.934 |
| -0.551999999999999 | 26.546 | 58.743 | 105.758 |
| -0.549999999999999 | 26.465 | 58.602 | 105.583 |
| -0.547999999999999 | 26.385 | 58.46 | 105.407 |
| -0.545999999999999 | 26.305 | 58.319 | 105.232 |
| -0.543999999999999 | 26.225 | 58.178 | 105.057 |
| -0.541999999999999 | 26.145 | 58.037 | 104.882 |
| -0.539999999999999 | 26.066 | 57.896 | 104.707 |
| -0.537999999999999 | 25.986 | 57.755 | 104.532 |
| -0.535999999999999 | 25.907 | 57.615 | 104.358 |
| -0.533999999999999 | 25.828 | 57.475 | 104.184 |
| -0.531999999999999 | 25.748 | 57.335 | 104.01 |
| -0.529999999999999 | 25.669 | 57.196 | 103.836 |
| -0.527999999999999 | 25.591 | 57.056 | 103.662 |
| -0.525999999999999 | 25.512 | 56.917 | 103.489 |
| -0.523999999999999 | 25.433 | 56.778 | 103.315 |
| -0.521999999999999 | 25.355 | 56.639 | 103.142 |
| -0.519999999999999 | 25.276 | 56.5 | 102.969 |
| -0.517999999999999 | 25.198 | 56.362 | 102.796 |
| -0.515999999999999 | 25.12 | 56.224 | 102.624 |
| -0.513999999999999 | 25.042 | 56.086 | 102.452 |
| -0.511999999999999 | 24.964 | 55.948 | 102.279 |
| -0.509999999999999 | 24.887 | 55.81 | 102.107 |
| -0.507999999999999 | 24.809 | 55.673 | 101.935 |
| -0.505999999999999 | 24.732 | 55.535 | 101.764 |
| -0.503999999999999 | 24.654 | 55.398 | 101.592 |
| -0.501999999999999 | 24.577 | 55.262 | 101.421 |
| -0.499999999999999 | 24.5 | 55.125 | 101.25 |
| -0.497999999999999 | 24.423 | 54.989 | 101.079 |
| -0.495999999999999 | 24.346 | 54.852 | 100.908 |
| -0.493999999999999 | 24.27 | 54.716 | 100.738 |
| -0.491999999999999 | 24.193 | 54.581 | 100.567 |
| -0.489999999999999 | 24.117 | 54.445 | 100.397 |
| -0.487999999999999 | 24.04 | 54.31 | 100.227 |
| -0.485999999999999 | 23.964 | 54.174 | 100.058 |
| -0.483999999999999 | 23.888 | 54.04 | 99.888 |
| -0.481999999999999 | 23.812 | 53.905 | 99.718 |
| -0.479999999999999 | 23.736 | 53.77 | 99.549 |
| -0.477999999999999 | 23.661 | 53.636 | 99.38 |
| -0.475999999999999 | 23.585 | 53.502 | 99.211 |
| -0.473999999999999 | 23.51 | 53.368 | 99.043 |
| -0.471999999999999 | 23.435 | 53.234 | 98.874 |
| -0.469999999999999 | 23.359 | 53.1 | 98.706 |
| -0.467999999999999 | 23.284 | 52.967 | 98.537 |
| -0.465999999999999 | 23.209 | 52.834 | 98.37 |
| -0.463999999999999 | 23.135 | 52.701 | 98.202 |
| -0.461999999999999 | 23.06 | 52.568 | 98.034 |
| -0.459999999999999 | 22.985 | 52.436 | 97.867 |
| -0.457999999999999 | 22.911 | 52.303 | 97.699 |
| -0.455999999999999 | 22.837 | 52.171 | 97.532 |
| -0.453999999999999 | 22.763 | 52.039 | 97.365 |
| -0.451999999999999 | 22.689 | 51.907 | 97.199 |
| -0.449999999999999 | 22.615 | 51.776 | 97.032 |
| -0.447999999999999 | 22.541 | 51.645 | 96.866 |
| -0.445999999999999 | 22.467 | 51.513 | 96.7 |
| -0.443999999999999 | 22.394 | 51.382 | 96.534 |
| -0.441999999999999 | 22.32 | 51.252 | 96.368 |
| -0.439999999999999 | 22.247 | 51.121 | 96.202 |
| -0.437999999999999 | 22.174 | 50.991 | 96.037 |
| -0.435999999999999 | 22.101 | 50.861 | 95.872 |
| -0.433999999999999 | 22.028 | 50.731 | 95.707 |
| -0.431999999999999 | 21.955 | 50.601 | 95.542 |
| -0.429999999999999 | 21.883 | 50.471 | 95.377 |
| -0.427999999999999 | 21.81 | 50.342 | 95.212 |
| -0.425999999999999 | 21.738 | 50.213 | 95.048 |
| -0.423999999999999 | 21.666 | 50.084 | 94.884 |
| -0.421999999999999 | 21.593 | 49.955 | 94.72 |
| -0.419999999999999 | 21.521 | 49.827 | 94.556 |
| -0.417999999999999 | 21.449 | 49.698 | 94.393 |
| -0.415999999999999 | 21.378 | 49.57 | 94.229 |
| -0.413999999999999 | 21.306 | 49.442 | 94.066 |
| -0.411999999999999 | 21.235 | 49.314 | 93.903 |
| -0.409999999999999 | 21.163 | 49.187 | 93.74 |
| -0.407999999999999 | 21.092 | 49.059 | 93.577 |
| -0.405999999999999 | 21.021 | 48.932 | 93.415 |
| -0.403999999999999 | 20.95 | 48.805 | 93.252 |
| -0.401999999999999 | 20.879 | 48.679 | 93.09 |
| -0.399999999999999 | 20.808 | 48.552 | 92.928 |
| -0.397999999999999 | 20.737 | 48.426 | 92.766 |
| -0.395999999999999 | 20.667 | 48.299 | 92.605 |
| -0.393999999999999 | 20.596 | 48.173 | 92.443 |
| -0.391999999999999 | 20.526 | 48.048 | 92.282 |
| -0.389999999999999 | 20.456 | 47.922 | 92.121 |
| -0.387999999999999 | 20.386 | 47.797 | 91.96 |
| -0.385999999999999 | 20.316 | 47.671 | 91.799 |
| -0.383999999999999 | 20.246 | 47.546 | 91.638 |
| -0.381999999999999 | 20.176 | 47.422 | 91.478 |
| -0.379999999999999 | 20.107 | 47.297 | 91.318 |
| -0.377999999999999 | 20.038 | 47.173 | 91.158 |
| -0.375999999999999 | 19.968 | 47.048 | 90.998 |
| -0.373999999999999 | 19.899 | 46.924 | 90.838 |
| -0.371999999999999 | 19.83 | 46.801 | 90.679 |
| -0.369999999999998 | 19.761 | 46.677 | 90.519 |
| -0.367999999999998 | 19.692 | 46.553 | 90.36 |
| -0.365999999999998 | 19.623 | 46.43 | 90.201 |
| -0.363999999999998 | 19.555 | 46.307 | 90.042 |
| -0.361999999999998 | 19.486 | 46.184 | 89.884 |
| -0.359999999999998 | 19.418 | 46.062 | 89.725 |
| -0.357999999999998 | 19.35 | 45.939 | 89.567 |
| -0.355999999999998 | 19.282 | 45.817 | 89.409 |
| -0.353999999999998 | 19.214 | 45.695 | 89.251 |
| -0.351999999999998 | 19.146 | 45.573 | 89.093 |
| -0.349999999999998 | 19.078 | 45.451 | 88.936 |
| -0.347999999999998 | 19.011 | 45.33 | 88.778 |
| -0.345999999999998 | 18.943 | 45.208 | 88.621 |
| -0.343999999999998 | 18.876 | 45.087 | 88.464 |
| -0.341999999999998 | 18.809 | 44.966 | 88.307 |
| -0.339999999999998 | 18.741 | 44.846 | 88.151 |
| -0.337999999999998 | 18.674 | 44.725 | 87.994 |
| -0.335999999999998 | 18.608 | 44.605 | 87.838 |
| -0.333999999999998 | 18.541 | 44.484 | 87.682 |
| -0.331999999999998 | 18.474 | 44.364 | 87.526 |
| -0.329999999999998 | 18.408 | 44.245 | 87.37 |
| -0.327999999999998 | 18.341 | 44.125 | 87.214 |
| -0.325999999999998 | 18.275 | 44.006 | 87.059 |
| -0.323999999999998 | 18.209 | 43.887 | 86.904 |
| -0.321999999999998 | 18.143 | 43.768 | 86.748 |
| -0.319999999999998 | 18.077 | 43.649 | 86.594 |
| -0.317999999999998 | 18.011 | 43.53 | 86.439 |
| -0.315999999999998 | 17.945 | 43.412 | 86.284 |
| -0.313999999999998 | 17.88 | 43.293 | 86.13 |
| -0.311999999999998 | 17.814 | 43.175 | 85.976 |
| -0.309999999999998 | 17.749 | 43.057 | 85.822 |
| -0.307999999999998 | 17.684 | 42.94 | 85.668 |
| -0.305999999999998 | 17.619 | 42.822 | 85.514 |
| -0.303999999999998 | 17.554 | 42.705 | 85.361 |
| -0.301999999999998 | 17.489 | 42.588 | 85.207 |
| -0.299999999999998 | 17.424 | 42.471 | 85.054 |
| -0.297999999999998 | 17.359 | 42.354 | 84.901 |
| -0.295999999999998 | 17.295 | 42.238 | 84.748 |
| -0.293999999999998 | 17.23 | 42.121 | 84.596 |
| -0.291999999999998 | 17.166 | 42.005 | 84.443 |
| -0.289999999999998 | 17.102 | 41.889 | 84.291 |
| -0.287999999999998 | 17.038 | 41.773 | 84.139 |
| -0.285999999999998 | 16.974 | 41.658 | 83.987 |
| -0.283999999999998 | 16.91 | 41.542 | 83.835 |
| -0.281999999999998 | 16.847 | 41.427 | 83.683 |
| -0.279999999999998 | 16.783 | 41.312 | 83.532 |
| -0.277999999999998 | 16.72 | 41.197 | 83.381 |
| -0.275999999999998 | 16.656 | 41.083 | 83.23 |
| -0.273999999999998 | 16.593 | 40.968 | 83.079 |
| -0.271999999999998 | 16.53 | 40.854 | 82.928 |
| -0.269999999999998 | 16.467 | 40.74 | 82.777 |
| -0.267999999999998 | 16.404 | 40.626 | 82.627 |
| -0.265999999999998 | 16.341 | 40.512 | 82.477 |
| -0.263999999999998 | 16.279 | 40.399 | 82.327 |
| -0.261999999999998 | 16.216 | 40.285 | 82.177 |
| -0.259999999999998 | 16.154 | 40.172 | 82.027 |
| -0.257999999999998 | 16.092 | 40.059 | 81.878 |
| -0.255999999999998 | 16.03 | 39.947 | 81.728 |
| -0.253999999999998 | 15.967 | 39.834 | 81.579 |
| -0.251999999999998 | 15.906 | 39.722 | 81.43 |
| -0.249999999999998 | 15.844 | 39.609 | 81.281 |
| -0.247999999999998 | 15.782 | 39.497 | 81.133 |
| -0.245999999999998 | 15.72 | 39.385 | 80.984 |
| -0.243999999999998 | 15.659 | 39.274 | 80.836 |
| -0.241999999999998 | 15.598 | 39.162 | 80.688 |
| -0.239999999999998 | 15.536 | 39.051 | 80.54 |
| -0.237999999999998 | 15.475 | 38.94 | 80.392 |
| -0.235999999999998 | 15.414 | 38.829 | 80.244 |
| -0.233999999999998 | 15.353 | 38.718 | 80.097 |
| -0.231999999999998 | 15.293 | 38.608 | 79.949 |
| -0.229999999999998 | 15.232 | 38.497 | 79.802 |
| -0.227999999999998 | 15.171 | 38.387 | 79.655 |
| -0.225999999999998 | 15.111 | 38.277 | 79.509 |
| -0.223999999999998 | 15.051 | 38.167 | 79.362 |
| -0.221999999999998 | 14.991 | 38.058 | 79.216 |
| -0.219999999999998 | 14.93 | 37.948 | 79.069 |
| -0.217999999999998 | 14.871 | 37.839 | 78.923 |
| -0.215999999999998 | 14.811 | 37.73 | 78.777 |
| -0.213999999999998 | 14.751 | 37.621 | 78.632 |
| -0.211999999999998 | 14.691 | 37.512 | 78.486 |
| -0.209999999999998 | 14.632 | 37.404 | 78.341 |
| -0.207999999999998 | 14.572 | 37.296 | 78.195 |
| -0.205999999999998 | 14.513 | 37.187 | 78.05 |
| -0.203999999999998 | 14.454 | 37.079 | 77.905 |
| -0.201999999999998 | 14.395 | 36.972 | 77.761 |
| -0.199999999999998 | 14.336 | 36.864 | 77.616 |
| -0.197999999999998 | 14.277 | 36.757 | 77.472 |
| -0.195999999999998 | 14.218 | 36.649 | 77.327 |
| -0.193999999999998 | 14.16 | 36.542 | 77.183 |
| -0.191999999999998 | 14.101 | 36.435 | 77.039 |
| -0.189999999999998 | 14.043 | 36.329 | 76.896 |
| -0.187999999999998 | 13.985 | 36.222 | 76.752 |
| -0.185999999999998 | 13.927 | 36.116 | 76.609 |
| -0.183999999999998 | 13.869 | 36.01 | 76.466 |
| -0.181999999999998 | 13.811 | 35.904 | 76.323 |
| -0.179999999999998 | 13.753 | 35.798 | 76.18 |
| -0.177999999999998 | 13.695 | 35.692 | 76.037 |
| -0.175999999999998 | 13.638 | 35.587 | 75.894 |
| -0.173999999999998 | 13.58 | 35.482 | 75.752 |
| -0.171999999999998 | 13.523 | 35.377 | 75.61 |
| -0.169999999999998 | 13.466 | 35.272 | 75.468 |
| -0.167999999999998 | 13.408 | 35.167 | 75.326 |
| -0.165999999999998 | 13.351 | 35.062 | 75.184 |
| -0.163999999999998 | 13.294 | 34.958 | 75.043 |
| -0.161999999999998 | 13.238 | 34.854 | 74.901 |
| -0.159999999999998 | 13.181 | 34.75 | 74.76 |
| -0.157999999999998 | 13.124 | 34.646 | 74.619 |
| -0.155999999999998 | 13.068 | 34.542 | 74.478 |
| -0.153999999999998 | 13.012 | 34.439 | 74.338 |
| -0.151999999999998 | 12.955 | 34.336 | 74.197 |
| -0.149999999999998 | 12.899 | 34.233 | 74.057 |
| -0.147999999999998 | 12.843 | 34.13 | 73.917 |
| -0.145999999999998 | 12.787 | 34.027 | 73.777 |
| -0.143999999999998 | 12.732 | 33.924 | 73.637 |
| -0.141999999999998 | 12.676 | 33.822 | 73.497 |
| -0.139999999999998 | 12.62 | 33.72 | 73.357 |
| -0.137999999999998 | 12.565 | 33.618 | 73.218 |
| -0.135999999999998 | 12.509 | 33.516 | 73.079 |
| -0.133999999999998 | 12.454 | 33.414 | 72.94 |
| -0.131999999999998 | 12.399 | 33.313 | 72.801 |
| -0.129999999999998 | 12.344 | 33.211 | 72.662 |
| -0.127999999999998 | 12.289 | 33.11 | 72.524 |
| -0.125999999999998 | 12.234 | 33.009 | 72.386 |
| -0.123999999999998 | 12.18 | 32.909 | 72.247 |
| -0.121999999999998 | 12.125 | 32.808 | 72.109 |
| -0.119999999999998 | 12.071 | 32.708 | 71.971 |
| -0.117999999999998 | 12.016 | 32.607 | 71.834 |
| -0.115999999999998 | 11.962 | 32.507 | 71.696 |
| -0.113999999999998 | 11.908 | 32.407 | 71.559 |
| -0.111999999999998 | 11.854 | 32.308 | 71.422 |
| -0.109999999999998 | 11.8 | 32.208 | 71.285 |
| -0.107999999999998 | 11.746 | 32.109 | 71.148 |
| -0.105999999999998 | 11.692 | 32.01 | 71.011 |
| -0.103999999999998 | 11.639 | 31.911 | 70.875 |
| -0.101999999999998 | 11.585 | 31.812 | 70.738 |
| -0.0999999999999983 | 11.532 | 31.713 | 70.602 |
| -0.0979999999999983 | 11.479 | 31.615 | 70.466 |
| -0.0959999999999983 | 11.426 | 31.516 | 70.33 |
| -0.0939999999999983 | 11.373 | 31.418 | 70.194 |
| -0.0919999999999983 | 11.32 | 31.32 | 70.059 |
| -0.0899999999999983 | 11.267 | 31.222 | 69.923 |
| -0.0879999999999983 | 11.214 | 31.125 | 69.788 |
| -0.0859999999999983 | 11.161 | 31.027 | 69.653 |
| -0.0839999999999983 | 11.109 | 30.93 | 69.518 |
| -0.0819999999999983 | 11.057 | 30.833 | 69.384 |
| -0.0799999999999983 | 11.004 | 30.736 | 69.249 |
| -0.0779999999999983 | 10.952 | 30.639 | 69.115 |
| -0.0759999999999983 | 10.9 | 30.543 | 68.98 |
| -0.0739999999999983 | 10.848 | 30.446 | 68.846 |
| -0.0719999999999983 | 10.796 | 30.35 | 68.712 |
| -0.0699999999999983 | 10.744 | 30.254 | 68.579 |
| -0.0679999999999983 | 10.693 | 30.158 | 68.445 |
| -0.0659999999999983 | 10.641 | 30.062 | 68.312 |
| -0.0639999999999983 | 10.59 | 29.967 | 68.178 |
| -0.0619999999999983 | 10.538 | 29.871 | 68.045 |
| -0.0599999999999983 | 10.487 | 29.776 | 67.912 |
| -0.0579999999999983 | 10.436 | 29.681 | 67.78 |
| -0.0559999999999983 | 10.385 | 29.586 | 67.647 |
| -0.0539999999999983 | 10.334 | 29.492 | 67.515 |
| -0.0519999999999983 | 10.283 | 29.397 | 67.382 |
| -0.0499999999999983 | 10.233 | 29.303 | 67.25 |
| -0.0479999999999983 | 10.182 | 29.209 | 67.118 |
| -0.0459999999999983 | 10.132 | 29.115 | 66.987 |
| -0.0439999999999983 | 10.081 | 29.021 | 66.855 |
| -0.0419999999999983 | 10.031 | 28.927 | 66.723 |
| -0.0399999999999983 | 9.981 | 28.834 | 66.592 |
| -0.0379999999999982 | 9.931 | 28.74 | 66.461 |
| -0.0359999999999982 | 9.881 | 28.647 | 66.33 |
| -0.0339999999999982 | 9.831 | 28.554 | 66.199 |
| -0.0319999999999982 | 9.781 | 28.462 | 66.069 |
| -0.0299999999999982 | 9.732 | 28.369 | 65.938 |
| -0.0279999999999982 | 9.682 | 28.277 | 65.808 |
| -0.0259999999999982 | 9.633 | 28.184 | 65.678 |
| -0.0239999999999982 | 9.584 | 28.092 | 65.548 |
| -0.0219999999999982 | 9.534 | 28 | 65.418 |
| -0.0199999999999982 | 9.485 | 27.908 | 65.288 |
| -0.0179999999999982 | 9.436 | 27.817 | 65.158 |
| -0.0159999999999982 | 9.387 | 27.725 | 65.029 |
| -0.0139999999999982 | 9.339 | 27.634 | 64.9 |
| -0.0119999999999982 | 9.29 | 27.543 | 64.771 |
| -0.00999999999999823 | 9.241 | 27.452 | 64.642 |
| -0.00799999999999824 | 9.193 | 27.361 | 64.513 |
| -0.00599999999999824 | 9.144 | 27.271 | 64.385 |
| -0.00399999999999824 | 9.096 | 27.18 | 64.256 |
| -0.00199999999999824 | 9.048 | 27.09 | 64.128 |
| 1.76247905159244e-15 | 9 | 27 | 64 |
| 0.00200000000000176 | 8.952 | 26.91 | 63.872 |
| 0.00400000000000176 | 8.904 | 26.82 | 63.744 |
| 0.00600000000000176 | 8.856 | 26.731 | 63.617 |
| 0.00800000000000176 | 8.809 | 26.641 | 63.489 |
| 0.0100000000000018 | 8.761 | 26.552 | 63.362 |
| 0.0120000000000018 | 8.714 | 26.463 | 63.235 |
| 0.0140000000000018 | 8.667 | 26.374 | 63.108 |
| 0.0160000000000018 | 8.619 | 26.285 | 62.981 |
| 0.0180000000000018 | 8.572 | 26.197 | 62.854 |
| 0.0200000000000018 | 8.525 | 26.108 | 62.728 |
| 0.0220000000000018 | 8.478 | 26.02 | 62.602 |
| 0.0240000000000018 | 8.431 | 25.932 | 62.475 |
| 0.0260000000000018 | 8.385 | 25.844 | 62.349 |
| 0.0280000000000018 | 8.338 | 25.756 | 62.224 |
| 0.0300000000000018 | 8.292 | 25.669 | 62.098 |
| 0.0320000000000018 | 8.245 | 25.581 | 61.972 |
| 0.0340000000000018 | 8.199 | 25.494 | 61.847 |
| 0.0360000000000018 | 8.153 | 25.407 | 61.722 |
| 0.0380000000000018 | 8.107 | 25.32 | 61.597 |
| 0.0400000000000018 | 8.061 | 25.233 | 61.472 |
| 0.0420000000000018 | 8.015 | 25.147 | 61.347 |
| 0.0440000000000018 | 7.969 | 25.06 | 61.223 |
| 0.0460000000000018 | 7.923 | 24.974 | 61.098 |
| 0.0480000000000018 | 7.878 | 24.888 | 60.974 |
| 0.0500000000000018 | 7.832 | 24.802 | 60.85 |
| 0.0520000000000018 | 7.787 | 24.716 | 60.726 |
| 0.0540000000000018 | 7.742 | 24.631 | 60.602 |
| 0.0560000000000018 | 7.696 | 24.545 | 60.478 |
| 0.0580000000000018 | 7.651 | 24.46 | 60.355 |
| 0.0600000000000018 | 7.606 | 24.375 | 60.232 |
| 0.0620000000000018 | 7.561 | 24.29 | 60.108 |
| 0.0640000000000018 | 7.517 | 24.205 | 59.985 |
| 0.0660000000000018 | 7.472 | 24.121 | 59.863 |
| 0.0680000000000018 | 7.427 | 24.036 | 59.74 |
| 0.0700000000000018 | 7.383 | 23.952 | 59.617 |
| 0.0720000000000018 | 7.339 | 23.868 | 59.495 |
| 0.0740000000000018 | 7.294 | 23.784 | 59.373 |
| 0.0760000000000018 | 7.25 | 23.7 | 59.251 |
| 0.0780000000000018 | 7.206 | 23.616 | 59.129 |
| 0.0800000000000018 | 7.162 | 23.533 | 59.007 |
| 0.0820000000000018 | 7.118 | 23.45 | 58.885 |
| 0.0840000000000018 | 7.075 | 23.366 | 58.764 |
| 0.0860000000000018 | 7.031 | 23.283 | 58.643 |
| 0.0880000000000018 | 6.987 | 23.201 | 58.522 |
| 0.0900000000000018 | 6.944 | 23.118 | 58.401 |
| 0.0920000000000018 | 6.9 | 23.035 | 58.28 |
| 0.0940000000000018 | 6.857 | 22.953 | 58.159 |
| 0.0960000000000018 | 6.814 | 22.871 | 58.039 |
| 0.0980000000000018 | 6.771 | 22.789 | 57.918 |
| 0.100000000000002 | 6.728 | 22.707 | 57.798 |
| 0.102000000000002 | 6.685 | 22.625 | 57.678 |
| 0.104000000000002 | 6.642 | 22.544 | 57.558 |
| 0.106000000000002 | 6.6 | 22.462 | 57.438 |
| 0.108000000000002 | 6.557 | 22.381 | 57.319 |
| 0.110000000000002 | 6.515 | 22.3 | 57.199 |
| 0.112000000000002 | 6.472 | 22.219 | 57.08 |
| 0.114000000000002 | 6.43 | 22.138 | 56.961 |
| 0.116000000000002 | 6.388 | 22.058 | 56.842 |
| 0.118000000000002 | 6.346 | 21.977 | 56.723 |
| 0.120000000000002 | 6.304 | 21.897 | 56.605 |
| 0.122000000000002 | 6.262 | 21.817 | 56.486 |
| 0.124000000000002 | 6.22 | 21.737 | 56.368 |
| 0.126000000000002 | 6.178 | 21.657 | 56.25 |
| 0.128000000000002 | 6.137 | 21.578 | 56.131 |
| 0.130000000000002 | 6.095 | 21.498 | 56.014 |
| 0.132000000000002 | 6.054 | 21.419 | 55.896 |
| 0.134000000000002 | 6.013 | 21.34 | 55.778 |
| 0.136000000000002 | 5.971 | 21.261 | 55.661 |
| 0.138000000000002 | 5.93 | 21.182 | 55.544 |
| 0.140000000000002 | 5.889 | 21.103 | 55.427 |
| 0.142000000000002 | 5.848 | 21.025 | 55.31 |
| 0.144000000000002 | 5.808 | 20.946 | 55.193 |
| 0.146000000000002 | 5.767 | 20.868 | 55.076 |
| 0.148000000000002 | 5.726 | 20.79 | 54.96 |
| 0.150000000000002 | 5.686 | 20.712 | 54.843 |
| 0.152000000000002 | 5.645 | 20.635 | 54.727 |
| 0.154000000000002 | 5.605 | 20.557 | 54.611 |
| 0.156000000000002 | 5.565 | 20.48 | 54.495 |
| 0.158000000000002 | 5.525 | 20.402 | 54.379 |
| 0.160000000000002 | 5.485 | 20.325 | 54.264 |
| 0.162000000000002 | 5.445 | 20.248 | 54.148 |
| 0.164000000000002 | 5.405 | 20.172 | 54.033 |
| 0.166000000000002 | 5.365 | 20.095 | 53.918 |
| 0.168000000000002 | 5.325 | 20.018 | 53.803 |
| 0.170000000000002 | 5.286 | 19.942 | 53.688 |
| 0.172000000000002 | 5.246 | 19.866 | 53.574 |
| 0.174000000000002 | 5.207 | 19.79 | 53.459 |
| 0.176000000000002 | 5.168 | 19.714 | 53.345 |
| 0.178000000000002 | 5.129 | 19.638 | 53.23 |
| 0.180000000000002 | 5.09 | 19.563 | 53.116 |
| 0.182000000000002 | 5.051 | 19.488 | 53.002 |
| 0.184000000000002 | 5.012 | 19.412 | 52.889 |
| 0.186000000000002 | 4.973 | 19.337 | 52.775 |
| 0.188000000000002 | 4.934 | 19.262 | 52.662 |
| 0.190000000000002 | 4.896 | 19.188 | 52.548 |
| 0.192000000000002 | 4.857 | 19.113 | 52.435 |
| 0.194000000000002 | 4.819 | 19.038 | 52.322 |
| 0.196000000000002 | 4.78 | 18.964 | 52.209 |
| 0.198000000000002 | 4.742 | 18.89 | 52.097 |
| 0.200000000000002 | 4.704 | 18.816 | 51.984 |
| 0.202000000000002 | 4.666 | 18.742 | 51.872 |
| 0.204000000000002 | 4.628 | 18.668 | 51.759 |
| 0.206000000000002 | 4.59 | 18.595 | 51.647 |
| 0.208000000000002 | 4.552 | 18.522 | 51.535 |
| 0.210000000000002 | 4.515 | 18.448 | 51.423 |
| 0.212000000000002 | 4.477 | 18.375 | 51.312 |
| 0.214000000000002 | 4.44 | 18.302 | 51.2 |
| 0.216000000000002 | 4.402 | 18.23 | 51.089 |
| 0.218000000000002 | 4.365 | 18.157 | 50.978 |
| 0.220000000000002 | 4.328 | 18.084 | 50.867 |
| 0.222000000000002 | 4.291 | 18.012 | 50.756 |
| 0.224000000000002 | 4.254 | 17.94 | 50.645 |
| 0.226000000000002 | 4.217 | 17.868 | 50.534 |
| 0.228000000000002 | 4.18 | 17.796 | 50.424 |
| 0.230000000000002 | 4.143 | 17.724 | 50.314 |
| 0.232000000000002 | 4.107 | 17.653 | 50.204 |
| 0.234000000000002 | 4.07 | 17.581 | 50.093 |
| 0.236000000000002 | 4.034 | 17.51 | 49.984 |
| 0.238000000000002 | 3.997 | 17.439 | 49.874 |
| 0.240000000000002 | 3.961 | 17.368 | 49.764 |
| 0.242000000000002 | 3.925 | 17.297 | 49.655 |
| 0.244000000000002 | 3.889 | 17.227 | 49.546 |
| 0.246000000000002 | 3.853 | 17.156 | 49.437 |
| 0.248000000000002 | 3.817 | 17.086 | 49.328 |
| 0.250000000000002 | 3.781 | 17.016 | 49.219 |
| 0.252000000000002 | 3.746 | 16.946 | 49.11 |
| 0.254000000000002 | 3.71 | 16.876 | 49.002 |
| 0.256000000000002 | 3.674 | 16.806 | 48.893 |
| 0.258000000000002 | 3.639 | 16.736 | 48.785 |
| 0.260000000000002 | 3.604 | 16.667 | 48.677 |
| 0.262000000000002 | 3.568 | 16.598 | 48.569 |
| 0.264000000000002 | 3.533 | 16.528 | 48.461 |
| 0.266000000000002 | 3.498 | 16.459 | 48.353 |
| 0.268000000000002 | 3.463 | 16.391 | 48.246 |
| 0.270000000000002 | 3.428 | 16.322 | 48.139 |
| 0.272000000000002 | 3.394 | 16.253 | 48.031 |
| 0.274000000000002 | 3.359 | 16.185 | 47.924 |
| 0.276000000000002 | 3.324 | 16.117 | 47.817 |
| 0.278000000000002 | 3.29 | 16.049 | 47.711 |
| 0.280000000000002 | 3.255 | 15.981 | 47.604 |
| 0.282000000000002 | 3.221 | 15.913 | 47.498 |
| 0.284000000000002 | 3.187 | 15.845 | 47.391 |
| 0.286000000000002 | 3.153 | 15.778 | 47.285 |
| 0.288000000000002 | 3.118 | 15.71 | 47.179 |
| 0.290000000000002 | 3.085 | 15.643 | 47.073 |
| 0.292000000000002 | 3.051 | 15.576 | 46.967 |
| 0.294000000000002 | 3.017 | 15.509 | 46.862 |
| 0.296000000000002 | 2.983 | 15.442 | 46.756 |
| 0.298000000000002 | 2.95 | 15.375 | 46.651 |
| 0.300000000000002 | 2.916 | 15.309 | 46.546 |
| 0.302000000000002 | 2.883 | 15.243 | 46.441 |
| 0.304000000000002 | 2.849 | 15.176 | 46.336 |
| 0.306000000000002 | 2.816 | 15.11 | 46.231 |
| 0.308000000000002 | 2.783 | 15.044 | 46.127 |
| 0.310000000000002 | 2.75 | 14.979 | 46.022 |
| 0.312000000000002 | 2.717 | 14.913 | 45.918 |
| 0.314000000000002 | 2.684 | 14.848 | 45.814 |
| 0.316000000000002 | 2.651 | 14.782 | 45.71 |
| 0.318000000000002 | 2.618 | 14.717 | 45.606 |
| 0.320000000000002 | 2.586 | 14.652 | 45.502 |
| 0.322000000000002 | 2.553 | 14.587 | 45.399 |
| 0.324000000000002 | 2.521 | 14.522 | 45.295 |
| 0.326000000000002 | 2.488 | 14.458 | 45.192 |
| 0.328000000000002 | 2.456 | 14.393 | 45.089 |
| 0.330000000000002 | 2.424 | 14.329 | 44.986 |
| 0.332000000000002 | 2.392 | 14.265 | 44.883 |
| 0.334000000000002 | 2.36 | 14.201 | 44.781 |
| 0.336000000000002 | 2.328 | 14.137 | 44.678 |
| 0.338000000000002 | 2.296 | 14.073 | 44.576 |
| 0.340000000000002 | 2.264 | 14.01 | 44.473 |
| 0.342000000000002 | 2.233 | 13.946 | 44.371 |
| 0.344000000000002 | 2.201 | 13.883 | 44.269 |
| 0.346000000000002 | 2.169 | 13.82 | 44.167 |
| 0.348000000000002 | 2.138 | 13.757 | 44.066 |
| 0.350000000000002 | 2.107 | 13.694 | 43.964 |
| 0.352000000000002 | 2.076 | 13.631 | 43.863 |
| 0.354000000000002 | 2.044 | 13.569 | 43.762 |
| 0.356000000000002 | 2.013 | 13.506 | 43.66 |
| 0.358000000000002 | 1.982 | 13.444 | 43.56 |
| 0.360000000000002 | 1.951 | 13.382 | 43.459 |
| 0.362000000000002 | 1.921 | 13.32 | 43.358 |
| 0.364000000000002 | 1.89 | 13.258 | 43.257 |
| 0.366000000000002 | 1.859 | 13.196 | 43.157 |
| 0.368000000000002 | 1.829 | 13.134 | 43.057 |
| 0.370000000000002 | 1.798 | 13.073 | 42.957 |
| 0.372000000000002 | 1.768 | 13.012 | 42.857 |
| 0.374000000000002 | 1.738 | 12.95 | 42.757 |
| 0.376000000000002 | 1.708 | 12.889 | 42.657 |
| 0.378000000000002 | 1.677 | 12.829 | 42.558 |
| 0.380000000000002 | 1.647 | 12.768 | 42.458 |
| 0.382000000000002 | 1.618 | 12.707 | 42.359 |
| 0.384000000000002 | 1.588 | 12.647 | 42.26 |
| 0.386000000000002 | 1.558 | 12.586 | 42.161 |
| 0.388000000000002 | 1.528 | 12.526 | 42.062 |
| 0.390000000000002 | 1.499 | 12.466 | 41.963 |
| 0.392000000000002 | 1.469 | 12.406 | 41.865 |
| 0.394000000000002 | 1.44 | 12.346 | 41.766 |
| 0.396000000000002 | 1.41 | 12.287 | 41.668 |
| 0.398000000000002 | 1.381 | 12.227 | 41.57 |
| 0.400000000000002 | 1.352 | 12.168 | 41.472 |
| 0.402000000000002 | 1.323 | 12.109 | 41.374 |
| 0.404000000000002 | 1.294 | 12.05 | 41.276 |
| 0.406000000000002 | 1.265 | 11.991 | 41.179 |
| 0.408000000000002 | 1.236 | 11.932 | 41.081 |
| 0.410000000000002 | 1.207 | 11.873 | 40.984 |
| 0.412000000000002 | 1.179 | 11.815 | 40.887 |
| 0.414000000000002 | 1.15 | 11.756 | 40.79 |
| 0.416000000000002 | 1.122 | 11.698 | 40.693 |
| 0.418000000000002 | 1.093 | 11.64 | 40.596 |
| 0.420000000000002 | 1.065 | 11.582 | 40.5 |
| 0.422000000000002 | 1.037 | 11.524 | 40.403 |
| 0.424000000000002 | 1.009 | 11.467 | 40.307 |
| 0.426000000000002 | 0.981 | 11.409 | 40.211 |
| 0.428000000000002 | 0.953 | 11.352 | 40.115 |
| 0.430000000000002 | 0.925 | 11.294 | 40.019 |
| 0.432000000000002 | 0.897 | 11.237 | 39.923 |
| 0.434000000000002 | 0.869 | 11.18 | 39.828 |
| 0.436000000000002 | 0.841 | 11.123 | 39.732 |
| 0.438000000000002 | 0.814 | 11.067 | 39.637 |
| 0.440000000000002 | 0.786 | 11.01 | 39.542 |
| 0.442000000000002 | 0.759 | 10.954 | 39.447 |
| 0.444000000000002 | 0.732 | 10.897 | 39.352 |
| 0.446000000000002 | 0.704 | 10.841 | 39.257 |
| 0.448000000000002 | 0.677 | 10.785 | 39.162 |
| 0.450000000000002 | 0.65 | 10.729 | 39.068 |
| 0.452000000000002 | 0.623 | 10.673 | 38.973 |
| 0.454000000000002 | 0.596 | 10.618 | 38.879 |
| 0.456000000000002 | 0.57 | 10.562 | 38.785 |
| 0.458000000000002 | 0.543 | 10.507 | 38.691 |
| 0.460000000000002 | 0.516 | 10.452 | 38.597 |
| 0.462000000000002 | 0.49 | 10.396 | 38.504 |
| 0.464000000000002 | 0.463 | 10.342 | 38.41 |
| 0.466000000000002 | 0.437 | 10.287 | 38.317 |
| 0.468000000000002 | 0.41 | 10.232 | 38.223 |
| 0.470000000000002 | 0.384 | 10.177 | 38.13 |
| 0.472000000000002 | 0.358 | 10.123 | 38.037 |
| 0.474000000000002 | 0.332 | 10.069 | 37.945 |
| 0.476000000000002 | 0.306 | 10.015 | 37.852 |
| 0.478000000000002 | 0.28 | 9.961 | 37.759 |
| 0.480000000000002 | 0.254 | 9.907 | 37.667 |
| 0.482000000000002 | 0.228 | 9.853 | 37.575 |
| 0.484000000000002 | 0.203 | 9.799 | 37.482 |
| 0.486000000000002 | 0.177 | 9.746 | 37.39 |
| 0.488000000000002 | 0.151 | 9.692 | 37.298 |
| 0.490000000000002 | 0.126 | 9.639 | 37.207 |
| 0.492000000000002 | 0.101 | 9.586 | 37.115 |
| 0.494000000000002 | 0.075 | 9.533 | 37.024 |
| 0.496000000000002 | 0.05 | 9.48 | 36.932 |
| 0.498000000000002 | 0.025 | 9.428 | 36.841 |
| 0.500000000000002 | 0 | 9.375 | 36.75 |
| 0.502000000000002 | -0.025 | 9.323 | 36.659 |
| 0.504000000000002 | -0.05 | 9.27 | 36.568 |
| 0.506000000000002 | -0.075 | 9.218 | 36.478 |
| 0.508000000000002 | -0.099 | 9.166 | 36.387 |
| 0.510000000000002 | -0.124 | 9.114 | 36.297 |
| 0.512000000000002 | -0.149 | 9.062 | 36.206 |
| 0.514000000000002 | -0.173 | 9.011 | 36.116 |
| 0.516000000000002 | -0.197 | 8.959 | 36.026 |
| 0.518000000000002 | -0.222 | 8.908 | 35.936 |
| 0.520000000000002 | -0.246 | 8.857 | 35.847 |
| 0.522000000000002 | -0.27 | 8.805 | 35.757 |
| 0.524000000000002 | -0.294 | 8.754 | 35.668 |
| 0.526000000000002 | -0.318 | 8.704 | 35.578 |
| 0.528000000000002 | -0.342 | 8.653 | 35.489 |
| 0.530000000000002 | -0.366 | 8.602 | 35.4 |
| 0.532000000000002 | -0.39 | 8.552 | 35.311 |
| 0.534000000000002 | -0.414 | 8.501 | 35.223 |
| 0.536000000000002 | -0.437 | 8.451 | 35.134 |
| 0.538000000000002 | -0.461 | 8.401 | 35.045 |
| 0.540000000000002 | -0.484 | 8.351 | 34.957 |
| 0.542000000000002 | -0.508 | 8.301 | 34.869 |
| 0.544000000000002 | -0.531 | 8.252 | 34.781 |
| 0.546000000000002 | -0.554 | 8.202 | 34.693 |
| 0.548000000000002 | -0.577 | 8.153 | 34.605 |
| 0.550000000000002 | -0.6 | 8.103 | 34.517 |
| 0.552000000000002 | -0.623 | 8.054 | 34.43 |
| 0.554000000000002 | -0.646 | 8.005 | 34.342 |
| 0.556000000000002 | -0.669 | 7.956 | 34.255 |
| 0.558000000000002 | -0.692 | 7.907 | 34.168 |
| 0.560000000000002 | -0.714 | 7.859 | 34.081 |
| 0.562000000000002 | -0.737 | 7.81 | 33.994 |
| 0.564000000000002 | -0.76 | 7.762 | 33.907 |
| 0.566000000000002 | -0.782 | 7.714 | 33.82 |
| 0.568000000000002 | -0.804 | 7.665 | 33.734 |
| 0.570000000000002 | -0.827 | 7.617 | 33.648 |
| 0.572000000000002 | -0.849 | 7.569 | 33.561 |
| 0.574000000000002 | -0.871 | 7.522 | 33.475 |
| 0.576000000000002 | -0.893 | 7.474 | 33.389 |
| 0.578000000000002 | -0.915 | 7.426 | 33.303 |
| 0.580000000000002 | -0.937 | 7.379 | 33.218 |
| 0.582000000000002 | -0.959 | 7.332 | 33.132 |
| 0.584000000000002 | -0.981 | 7.285 | 33.047 |
| 0.586000000000002 | -1.002 | 7.238 | 32.961 |
| 0.588000000000002 | -1.024 | 7.191 | 32.876 |
| 0.590000000000002 | -1.045 | 7.144 | 32.791 |
| 0.592000000000002 | -1.067 | 7.097 | 32.706 |
| 0.594000000000002 | -1.088 | 7.051 | 32.622 |
| 0.596000000000002 | -1.11 | 7.004 | 32.537 |
| 0.598000000000002 | -1.131 | 6.958 | 32.452 |
| 0.600000000000002 | -1.152 | 6.912 | 32.368 |
| 0.602000000000002 | -1.173 | 6.866 | 32.284 |
| 0.604000000000002 | -1.194 | 6.82 | 32.2 |
| 0.606000000000002 | -1.215 | 6.774 | 32.116 |
| 0.608000000000002 | -1.236 | 6.729 | 32.032 |
| 0.610000000000002 | -1.257 | 6.683 | 31.948 |
| 0.612000000000002 | -1.277 | 6.638 | 31.864 |
| 0.614000000000002 | -1.298 | 6.592 | 31.781 |
| 0.616000000000002 | -1.319 | 6.547 | 31.698 |
| 0.618000000000002 | -1.339 | 6.502 | 31.614 |
| 0.620000000000002 | -1.359 | 6.457 | 31.531 |
| 0.622000000000002 | -1.38 | 6.413 | 31.448 |
| 0.624000000000002 | -1.4 | 6.368 | 31.366 |
| 0.626000000000002 | -1.42 | 6.323 | 31.283 |
| 0.628000000000002 | -1.44 | 6.279 | 31.2 |
| 0.630000000000002 | -1.46 | 6.235 | 31.118 |
| 0.632000000000002 | -1.48 | 6.191 | 31.036 |
| 0.634000000000002 | -1.5 | 6.147 | 30.953 |
| 0.636000000000002 | -1.52 | 6.103 | 30.871 |
| 0.638000000000002 | -1.54 | 6.059 | 30.789 |
| 0.640000000000002 | -1.559 | 6.015 | 30.708 |
| 0.642000000000002 | -1.579 | 5.972 | 30.626 |
| 0.644000000000002 | -1.599 | 5.928 | 30.545 |
| 0.646000000000002 | -1.618 | 5.885 | 30.463 |
| 0.648000000000002 | -1.637 | 5.842 | 30.382 |
| 0.650000000000002 | -1.657 | 5.799 | 30.301 |
| 0.652000000000002 | -1.676 | 5.756 | 30.22 |
| 0.654000000000002 | -1.695 | 5.713 | 30.139 |
| 0.656000000000002 | -1.714 | 5.67 | 30.058 |
| 0.658000000000002 | -1.733 | 5.628 | 29.977 |
| 0.660000000000002 | -1.752 | 5.585 | 29.897 |
| 0.662000000000002 | -1.771 | 5.543 | 29.817 |
| 0.664000000000002 | -1.79 | 5.501 | 29.736 |
| 0.666000000000002 | -1.809 | 5.458 | 29.656 |
| 0.668000000000002 | -1.827 | 5.416 | 29.576 |
| 0.670000000000002 | -1.846 | 5.375 | 29.496 |
| 0.672000000000002 | -1.864 | 5.333 | 29.417 |
| 0.674000000000002 | -1.883 | 5.291 | 29.337 |
| 0.676000000000002 | -1.901 | 5.25 | 29.258 |
| 0.678000000000002 | -1.919 | 5.208 | 29.178 |
| 0.680000000000002 | -1.938 | 5.167 | 29.099 |
| 0.682000000000002 | -1.956 | 5.126 | 29.02 |
| 0.684000000000002 | -1.974 | 5.085 | 28.941 |
| 0.686000000000002 | -1.992 | 5.044 | 28.862 |
| 0.688000000000002 | -2.01 | 5.003 | 28.784 |
| 0.690000000000002 | -2.028 | 4.963 | 28.705 |
| 0.692000000000002 | -2.046 | 4.922 | 28.627 |
| 0.694000000000002 | -2.063 | 4.882 | 28.548 |
| 0.696000000000002 | -2.081 | 4.841 | 28.47 |
| 0.698000000000002 | -2.098 | 4.801 | 28.392 |
| 0.700000000000002 | -2.116 | 4.761 | 28.314 |
| 0.702000000000002 | -2.133 | 4.721 | 28.236 |
| 0.704000000000002 | -2.151 | 4.681 | 28.158 |
| 0.706000000000002 | -2.168 | 4.641 | 28.081 |
| 0.708000000000002 | -2.185 | 4.602 | 28.003 |
| 0.710000000000002 | -2.203 | 4.562 | 27.926 |
| 0.712000000000002 | -2.22 | 4.523 | 27.849 |
| 0.714000000000002 | -2.237 | 4.484 | 27.772 |
| 0.716000000000002 | -2.254 | 4.445 | 27.695 |
| 0.718000000000002 | -2.27 | 4.406 | 27.618 |
| 0.720000000000002 | -2.287 | 4.367 | 27.542 |
| 0.722000000000002 | -2.304 | 4.328 | 27.465 |
| 0.724000000000002 | -2.321 | 4.289 | 27.389 |
| 0.726000000000002 | -2.337 | 4.251 | 27.312 |
| 0.728000000000002 | -2.354 | 4.212 | 27.236 |
| 0.730000000000002 | -2.37 | 4.174 | 27.16 |
| 0.732000000000002 | -2.387 | 4.136 | 27.084 |
| 0.734000000000002 | -2.403 | 4.098 | 27.008 |
| 0.736000000000002 | -2.419 | 4.06 | 26.933 |
| 0.738000000000002 | -2.436 | 4.022 | 26.857 |
| 0.740000000000002 | -2.452 | 3.984 | 26.782 |
| 0.742000000000002 | -2.468 | 3.946 | 26.706 |
| 0.744000000000002 | -2.484 | 3.909 | 26.631 |
| 0.746000000000002 | -2.5 | 3.871 | 26.556 |
| 0.748000000000002 | -2.515 | 3.834 | 26.481 |
| 0.750000000000002 | -2.531 | 3.797 | 26.406 |
| 0.752000000000002 | -2.547 | 3.76 | 26.332 |
| 0.754000000000002 | -2.563 | 3.723 | 26.257 |
| 0.756000000000002 | -2.578 | 3.686 | 26.183 |
| 0.758000000000002 | -2.594 | 3.649 | 26.108 |
| 0.760000000000002 | -2.609 | 3.613 | 26.034 |
| 0.762000000000002 | -2.625 | 3.576 | 25.96 |
| 0.764000000000002 | -2.64 | 3.54 | 25.886 |
| 0.766000000000002 | -2.655 | 3.504 | 25.812 |
| 0.768000000000002 | -2.67 | 3.467 | 25.739 |
| 0.770000000000002 | -2.685 | 3.431 | 25.665 |
| 0.772000000000002 | -2.7 | 3.395 | 25.591 |
| 0.774000000000002 | -2.715 | 3.36 | 25.518 |
| 0.776000000000002 | -2.73 | 3.324 | 25.445 |
| 0.778000000000002 | -2.745 | 3.288 | 25.372 |
| 0.780000000000002 | -2.76 | 3.253 | 25.299 |
| 0.782000000000002 | -2.775 | 3.217 | 25.226 |
| 0.784000000000002 | -2.789 | 3.182 | 25.153 |
| 0.786000000000002 | -2.804 | 3.147 | 25.081 |
| 0.788000000000002 | -2.818 | 3.112 | 25.008 |
| 0.790000000000002 | -2.833 | 3.077 | 24.936 |
| 0.792000000000002 | -2.847 | 3.042 | 24.864 |
| 0.794000000000002 | -2.861 | 3.007 | 24.792 |
| 0.796000000000002 | -2.876 | 2.973 | 24.72 |
| 0.798000000000002 | -2.89 | 2.938 | 24.648 |
| 0.800000000000002 | -2.904 | 2.904 | 24.576 |
| 0.802000000000002 | -2.918 | 2.87 | 24.504 |
| 0.804000000000002 | -2.932 | 2.836 | 24.433 |
| 0.806000000000002 | -2.946 | 2.802 | 24.362 |
| 0.808000000000002 | -2.96 | 2.768 | 24.29 |
| 0.810000000000002 | -2.974 | 2.734 | 24.219 |
| 0.812000000000002 | -2.987 | 2.7 | 24.148 |
| 0.814000000000002 | -3.001 | 2.666 | 24.077 |
| 0.816000000000002 | -3.015 | 2.633 | 24.006 |
| 0.818000000000002 | -3.028 | 2.6 | 23.936 |
| 0.820000000000002 | -3.042 | 2.566 | 23.865 |
| 0.822000000000002 | -3.055 | 2.533 | 23.795 |
| 0.824000000000002 | -3.068 | 2.5 | 23.725 |
| 0.826000000000002 | -3.082 | 2.467 | 23.654 |
| 0.828000000000002 | -3.095 | 2.434 | 23.584 |
| 0.830000000000002 | -3.108 | 2.402 | 23.514 |
| 0.832000000000002 | -3.121 | 2.369 | 23.445 |
| 0.834000000000002 | -3.134 | 2.336 | 23.375 |
| 0.836000000000002 | -3.147 | 2.304 | 23.305 |
| 0.838000000000002 | -3.16 | 2.272 | 23.236 |
| 0.840000000000002 | -3.173 | 2.239 | 23.167 |
| 0.842000000000002 | -3.185 | 2.207 | 23.097 |
| 0.844000000000002 | -3.198 | 2.175 | 23.028 |
| 0.846000000000002 | -3.211 | 2.144 | 22.959 |
| 0.848000000000002 | -3.223 | 2.112 | 22.89 |
| 0.850000000000002 | -3.236 | 2.08 | 22.822 |
| 0.852000000000002 | -3.248 | 2.049 | 22.753 |
| 0.854000000000002 | -3.261 | 2.017 | 22.685 |
| 0.856000000000002 | -3.273 | 1.986 | 22.616 |
| 0.858000000000002 | -3.285 | 1.955 | 22.548 |
| 0.860000000000002 | -3.297 | 1.923 | 22.48 |
| 0.862000000000002 | -3.309 | 1.892 | 22.412 |
| 0.864000000000002 | -3.321 | 1.861 | 22.344 |
| 0.866000000000002 | -3.333 | 1.831 | 22.276 |
| 0.868000000000002 | -3.345 | 1.8 | 22.209 |
| 0.870000000000002 | -3.357 | 1.769 | 22.141 |
| 0.872000000000002 | -3.369 | 1.739 | 22.074 |
| 0.874000000000002 | -3.381 | 1.709 | 22.006 |
| 0.876000000000002 | -3.393 | 1.678 | 21.939 |
| 0.878000000000002 | -3.404 | 1.648 | 21.872 |
| 0.880000000000002 | -3.416 | 1.618 | 21.805 |
| 0.882000000000002 | -3.427 | 1.588 | 21.738 |
| 0.884000000000002 | -3.439 | 1.558 | 21.672 |
| 0.886000000000002 | -3.45 | 1.528 | 21.605 |
| 0.888000000000002 | -3.461 | 1.499 | 21.538 |
| 0.890000000000002 | -3.473 | 1.469 | 21.472 |
| 0.892000000000002 | -3.484 | 1.44 | 21.406 |
| 0.894000000000002 | -3.495 | 1.41 | 21.34 |
| 0.896000000000002 | -3.506 | 1.381 | 21.274 |
| 0.898000000000002 | -3.517 | 1.352 | 21.208 |
| 0.900000000000002 | -3.528 | 1.323 | 21.142 |
| 0.902000000000002 | -3.539 | 1.294 | 21.076 |
| 0.904000000000002 | -3.55 | 1.265 | 21.011 |
| 0.906000000000002 | -3.56 | 1.237 | 20.945 |
| 0.908000000000002 | -3.571 | 1.208 | 20.88 |
| 0.910000000000002 | -3.582 | 1.179 | 20.815 |
| 0.912000000000002 | -3.592 | 1.151 | 20.75 |
| 0.914000000000002 | -3.603 | 1.123 | 20.685 |
| 0.916000000000002 | -3.613 | 1.094 | 20.62 |
| 0.918000000000002 | -3.624 | 1.066 | 20.555 |
| 0.920000000000002 | -3.634 | 1.038 | 20.491 |
| 0.922000000000002 | -3.644 | 1.01 | 20.426 |
| 0.924000000000002 | -3.655 | 0.983 | 20.362 |
| 0.926000000000002 | -3.665 | 0.955 | 20.297 |
| 0.928000000000002 | -3.675 | 0.927 | 20.233 |
| 0.930000000000002 | -3.685 | 0.9 | 20.169 |
| 0.932000000000002 | -3.695 | 0.872 | 20.105 |
| 0.934000000000002 | -3.705 | 0.845 | 20.042 |
| 0.936000000000002 | -3.715 | 0.818 | 19.978 |
| 0.938000000000002 | -3.725 | 0.791 | 19.914 |
| 0.940000000000002 | -3.734 | 0.764 | 19.851 |
| 0.942000000000002 | -3.744 | 0.737 | 19.787 |
| 0.944000000000002 | -3.754 | 0.71 | 19.724 |
| 0.946000000000002 | -3.763 | 0.683 | 19.661 |
| 0.948000000000002 | -3.773 | 0.657 | 19.598 |
| 0.950000000000002 | -3.782 | 0.63 | 19.535 |
| 0.952000000000002 | -3.792 | 0.604 | 19.472 |
| 0.954000000000002 | -3.801 | 0.578 | 19.41 |
| 0.956000000000002 | -3.81 | 0.551 | 19.347 |
| 0.958000000000002 | -3.82 | 0.525 | 19.285 |
| 0.960000000000002 | -3.829 | 0.499 | 19.223 |
| 0.962000000000002 | -3.838 | 0.473 | 19.16 |
| 0.964000000000002 | -3.847 | 0.448 | 19.098 |
| 0.966000000000002 | -3.856 | 0.422 | 19.036 |
| 0.968000000000002 | -3.865 | 0.396 | 18.974 |
| 0.970000000000002 | -3.874 | 0.371 | 18.913 |
| 0.972000000000002 | -3.882 | 0.345 | 18.851 |
| 0.974000000000003 | -3.891 | 0.32 | 18.789 |
| 0.976000000000003 | -3.9 | 0.295 | 18.728 |
| 0.978000000000003 | -3.909 | 0.27 | 18.667 |
| 0.980000000000002 | -3.917 | 0.245 | 18.606 |
| 0.982000000000002 | -3.926 | 0.22 | 18.545 |
| 0.984000000000003 | -3.934 | 0.195 | 18.484 |
| 0.986000000000003 | -3.943 | 0.17 | 18.423 |
| 0.988000000000003 | -3.951 | 0.146 | 18.362 |
| 0.990000000000002 | -3.959 | 0.121 | 18.301 |
| 0.992000000000002 | -3.968 | 0.097 | 18.241 |
| 0.994000000000003 | -3.976 | 0.072 | 18.181 |
| 0.996000000000003 | -3.984 | 0.048 | 18.12 |
| 0.998000000000003 | -3.992 | 0.024 | 18.06 |
| 1.000000000000002 | -4 | 0 | 18 |
| 1.002000000000002 | -4.008 | -0.024 | 17.94 |
| 1.004000000000002 | -4.016 | -0.048 | 17.88 |
| 1.006000000000002 | -4.024 | -0.072 | 17.821 |
| 1.008000000000002 | -4.032 | -0.095 | 17.761 |
| 1.010000000000002 | -4.039 | -0.119 | 17.701 |
| 1.012000000000002 | -4.047 | -0.142 | 17.642 |
| 1.014000000000002 | -4.055 | -0.166 | 17.583 |
| 1.016000000000002 | -4.062 | -0.189 | 17.524 |
| 1.018000000000002 | -4.07 | -0.212 | 17.465 |
| 1.020000000000002 | -4.077 | -0.235 | 17.406 |
| 1.022000000000002 | -4.085 | -0.258 | 17.347 |
| 1.024000000000002 | -4.092 | -0.281 | 17.288 |
| 1.026000000000002 | -4.099 | -0.304 | 17.229 |
| 1.028000000000002 | -4.107 | -0.327 | 17.171 |
| 1.030000000000002 | -4.114 | -0.349 | 17.113 |
| 1.032000000000002 | -4.121 | -0.372 | 17.054 |
| 1.034000000000002 | -4.128 | -0.394 | 16.996 |
| 1.036000000000002 | -4.135 | -0.417 | 16.938 |
| 1.038000000000002 | -4.142 | -0.439 | 16.88 |
| 1.040000000000002 | -4.149 | -0.461 | 16.822 |
| 1.042000000000002 | -4.156 | -0.483 | 16.765 |
| 1.044000000000002 | -4.163 | -0.505 | 16.707 |
| 1.046000000000002 | -4.169 | -0.527 | 16.649 |
| 1.048000000000002 | -4.176 | -0.549 | 16.592 |
| 1.050000000000002 | -4.183 | -0.57 | 16.535 |
| 1.052000000000002 | -4.189 | -0.592 | 16.478 |
| 1.054000000000002 | -4.196 | -0.613 | 16.421 |
| 1.056000000000002 | -4.202 | -0.635 | 16.364 |
| 1.058000000000002 | -4.209 | -0.656 | 16.307 |
| 1.060000000000002 | -4.215 | -0.677 | 16.25 |
| 1.062000000000002 | -4.222 | -0.699 | 16.193 |
| 1.064000000000002 | -4.228 | -0.72 | 16.137 |
| 1.066000000000002 | -4.234 | -0.741 | 16.08 |
| 1.068000000000002 | -4.24 | -0.761 | 16.024 |
| 1.070000000000002 | -4.246 | -0.782 | 15.968 |
| 1.072000000000002 | -4.252 | -0.803 | 15.912 |
| 1.074000000000003 | -4.258 | -0.824 | 15.856 |
| 1.076000000000003 | -4.264 | -0.844 | 15.8 |
| 1.078000000000003 | -4.27 | -0.864 | 15.744 |
| 1.080000000000002 | -4.276 | -0.885 | 15.689 |
| 1.082000000000002 | -4.282 | -0.905 | 15.633 |
| 1.084000000000003 | -4.288 | -0.925 | 15.578 |
| 1.086000000000003 | -4.294 | -0.945 | 15.522 |
| 1.088000000000003 | -4.299 | -0.965 | 15.467 |
| 1.090000000000002 | -4.305 | -0.985 | 15.412 |
| 1.092000000000002 | -4.31 | -1.005 | 15.357 |
| 1.094000000000003 | -4.316 | -1.024 | 15.302 |
| 1.096000000000003 | -4.321 | -1.044 | 15.247 |
| 1.098000000000003 | -4.327 | -1.064 | 15.193 |
| 1.100000000000003 | -4.332 | -1.083 | 15.138 |
| 1.102000000000003 | -4.337 | -1.102 | 15.084 |
| 1.104000000000003 | -4.343 | -1.122 | 15.029 |
| 1.106000000000003 | -4.348 | -1.141 | 14.975 |
| 1.108000000000003 | -4.353 | -1.16 | 14.921 |
| 1.110000000000003 | -4.358 | -1.179 | 14.867 |
| 1.112000000000003 | -4.363 | -1.198 | 14.813 |
| 1.114000000000003 | -4.368 | -1.216 | 14.759 |
| 1.116000000000003 | -4.373 | -1.235 | 14.705 |
| 1.118000000000003 | -4.378 | -1.254 | 14.652 |
| 1.120000000000003 | -4.383 | -1.272 | 14.598 |
| 1.122000000000003 | -4.387 | -1.291 | 14.545 |
| 1.124000000000003 | -4.392 | -1.309 | 14.491 |
| 1.126000000000003 | -4.397 | -1.327 | 14.438 |
| 1.128000000000003 | -4.402 | -1.346 | 14.385 |
| 1.130000000000003 | -4.406 | -1.364 | 14.332 |
| 1.132000000000003 | -4.411 | -1.382 | 14.279 |
| 1.134000000000003 | -4.415 | -1.4 | 14.227 |
| 1.136000000000003 | -4.42 | -1.418 | 14.174 |
| 1.138000000000003 | -4.424 | -1.435 | 14.121 |
| 1.140000000000003 | -4.428 | -1.453 | 14.069 |
| 1.142000000000003 | -4.433 | -1.471 | 14.017 |
| 1.144000000000003 | -4.437 | -1.488 | 13.964 |
| 1.146000000000003 | -4.441 | -1.506 | 13.912 |
| 1.148000000000003 | -4.445 | -1.523 | 13.86 |
| 1.150000000000003 | -4.449 | -1.54 | 13.808 |
| 1.152000000000003 | -4.453 | -1.557 | 13.756 |
| 1.154000000000003 | -4.457 | -1.574 | 13.705 |
| 1.156000000000003 | -4.461 | -1.591 | 13.653 |
| 1.158000000000003 | -4.465 | -1.608 | 13.602 |
| 1.160000000000003 | -4.469 | -1.625 | 13.55 |
| 1.162000000000003 | -4.473 | -1.642 | 13.499 |
| 1.164000000000003 | -4.477 | -1.658 | 13.448 |
| 1.166000000000003 | -4.48 | -1.675 | 13.397 |
| 1.168000000000003 | -4.484 | -1.692 | 13.346 |
| 1.170000000000003 | -4.488 | -1.708 | 13.295 |
| 1.172000000000003 | -4.491 | -1.724 | 13.244 |
| 1.174000000000003 | -4.495 | -1.74 | 13.193 |
| 1.176000000000003 | -4.498 | -1.757 | 13.143 |
| 1.178000000000003 | -4.501 | -1.773 | 13.092 |
| 1.180000000000003 | -4.505 | -1.789 | 13.042 |
| 1.182000000000003 | -4.508 | -1.805 | 12.992 |
| 1.184000000000003 | -4.511 | -1.82 | 12.942 |
| 1.186000000000003 | -4.515 | -1.836 | 12.891 |
| 1.188000000000003 | -4.518 | -1.852 | 12.842 |
| 1.190000000000003 | -4.521 | -1.867 | 12.792 |
| 1.192000000000003 | -4.524 | -1.883 | 12.742 |
| 1.194000000000003 | -4.527 | -1.898 | 12.692 |
| 1.196000000000003 | -4.53 | -1.914 | 12.643 |
| 1.198000000000003 | -4.533 | -1.929 | 12.593 |
| 1.200000000000003 | -4.536 | -1.944 | 12.544 |
| 1.202000000000003 | -4.539 | -1.959 | 12.495 |
| 1.204000000000003 | -4.542 | -1.974 | 12.446 |
| 1.206000000000003 | -4.544 | -1.989 | 12.397 |
| 1.208000000000003 | -4.547 | -2.004 | 12.348 |
| 1.210000000000003 | -4.55 | -2.019 | 12.299 |
| 1.212000000000003 | -4.552 | -2.033 | 12.25 |
| 1.214000000000003 | -4.555 | -2.048 | 12.202 |
| 1.216000000000003 | -4.558 | -2.062 | 12.153 |
| 1.218000000000003 | -4.56 | -2.077 | 12.105 |
| 1.220000000000003 | -4.562 | -2.091 | 12.056 |
| 1.222000000000003 | -4.565 | -2.105 | 12.008 |
| 1.224000000000003 | -4.567 | -2.12 | 11.96 |
| 1.226000000000003 | -4.57 | -2.134 | 11.912 |
| 1.228000000000003 | -4.572 | -2.148 | 11.864 |
| 1.230000000000003 | -4.574 | -2.162 | 11.816 |
| 1.232000000000003 | -4.576 | -2.176 | 11.769 |
| 1.234000000000003 | -4.578 | -2.189 | 11.721 |
| 1.236000000000003 | -4.58 | -2.203 | 11.673 |
| 1.238000000000003 | -4.582 | -2.217 | 11.626 |
| 1.240000000000003 | -4.584 | -2.23 | 11.579 |
| 1.242000000000003 | -4.586 | -2.244 | 11.532 |
| 1.244000000000003 | -4.588 | -2.257 | 11.484 |
| 1.246000000000003 | -4.59 | -2.27 | 11.437 |
| 1.248000000000003 | -4.592 | -2.284 | 11.391 |
| 1.250000000000003 | -4.594 | -2.297 | 11.344 |
| 1.252000000000003 | -4.595 | -2.31 | 11.297 |
| 1.254000000000003 | -4.597 | -2.323 | 11.25 |
| 1.256000000000003 | -4.599 | -2.336 | 11.204 |
| 1.258000000000003 | -4.6 | -2.349 | 11.158 |
| 1.260000000000003 | -4.602 | -2.362 | 11.111 |
| 1.262000000000003 | -4.603 | -2.374 | 11.065 |
| 1.264000000000003 | -4.605 | -2.387 | 11.019 |
| 1.266000000000003 | -4.606 | -2.399 | 10.973 |
| 1.268000000000003 | -4.608 | -2.412 | 10.927 |
| 1.270000000000003 | -4.609 | -2.424 | 10.881 |
| 1.272000000000003 | -4.61 | -2.437 | 10.836 |
| 1.274000000000003 | -4.612 | -2.449 | 10.79 |
| 1.276000000000003 | -4.613 | -2.461 | 10.744 |
| 1.278000000000003 | -4.614 | -2.473 | 10.699 |
| 1.280000000000003 | -4.615 | -2.485 | 10.654 |
| 1.282000000000003 | -4.616 | -2.497 | 10.608 |
| 1.284000000000003 | -4.617 | -2.509 | 10.563 |
| 1.286000000000003 | -4.618 | -2.521 | 10.518 |
| 1.288000000000003 | -4.619 | -2.532 | 10.473 |
| 1.290000000000003 | -4.62 | -2.544 | 10.429 |
| 1.292000000000003 | -4.621 | -2.556 | 10.384 |
| 1.294000000000003 | -4.622 | -2.567 | 10.339 |
| 1.296000000000003 | -4.623 | -2.578 | 10.295 |
| 1.298000000000003 | -4.623 | -2.59 | 10.25 |
| 1.300000000000003 | -4.624 | -2.601 | 10.206 |
| 1.302000000000003 | -4.625 | -2.612 | 10.162 |
| 1.304000000000003 | -4.625 | -2.623 | 10.118 |
| 1.306000000000003 | -4.626 | -2.634 | 10.074 |
| 1.308000000000003 | -4.626 | -2.645 | 10.03 |
| 1.310000000000003 | -4.627 | -2.656 | 9.986 |
| 1.312000000000003 | -4.627 | -2.667 | 9.942 |
| 1.314000000000003 | -4.628 | -2.678 | 9.898 |
| 1.316000000000003 | -4.628 | -2.688 | 9.855 |
| 1.318000000000003 | -4.628 | -2.699 | 9.811 |
| 1.320000000000003 | -4.629 | -2.71 | 9.768 |
| 1.322000000000003 | -4.629 | -2.72 | 9.725 |
| 1.324000000000003 | -4.629 | -2.73 | 9.682 |
| 1.326000000000003 | -4.629 | -2.741 | 9.639 |
| 1.328000000000003 | -4.629 | -2.751 | 9.596 |
| 1.330000000000003 | -4.63 | -2.761 | 9.553 |
| 1.332000000000003 | -4.63 | -2.771 | 9.51 |
| 1.334000000000003 | -4.63 | -2.781 | 9.467 |
| 1.336000000000003 | -4.63 | -2.791 | 9.425 |
| 1.338000000000003 | -4.63 | -2.801 | 9.382 |
| 1.340000000000003 | -4.629 | -2.811 | 9.34 |
| 1.342000000000003 | -4.629 | -2.82 | 9.297 |
| 1.344000000000003 | -4.629 | -2.83 | 9.255 |
| 1.346000000000003 | -4.629 | -2.84 | 9.213 |
| 1.348000000000003 | -4.629 | -2.849 | 9.171 |
| 1.350000000000003 | -4.628 | -2.859 | 9.129 |
| 1.352000000000003 | -4.628 | -2.868 | 9.087 |
| 1.354000000000003 | -4.628 | -2.877 | 9.046 |
| 1.356000000000003 | -4.627 | -2.887 | 9.004 |
| 1.358000000000003 | -4.627 | -2.896 | 8.963 |
| 1.360000000000003 | -4.626 | -2.905 | 8.921 |
| 1.362000000000003 | -4.626 | -2.914 | 8.88 |
| 1.364000000000003 | -4.625 | -2.923 | 8.838 |
| 1.366000000000003 | -4.624 | -2.932 | 8.797 |
| 1.368000000000003 | -4.624 | -2.94 | 8.756 |
| 1.370000000000003 | -4.623 | -2.949 | 8.715 |
| 1.372000000000003 | -4.622 | -2.958 | 8.674 |
| 1.374000000000003 | -4.621 | -2.966 | 8.634 |
| 1.376000000000003 | -4.621 | -2.975 | 8.593 |
| 1.378000000000003 | -4.62 | -2.983 | 8.552 |
| 1.380000000000003 | -4.619 | -2.992 | 8.512 |
| 1.382000000000003 | -4.618 | -3 | 8.471 |
| 1.384000000000003 | -4.617 | -3.008 | 8.431 |
| 1.386000000000003 | -4.616 | -3.017 | 8.391 |
| 1.388000000000003 | -4.615 | -3.025 | 8.351 |
| 1.390000000000003 | -4.614 | -3.033 | 8.311 |
| 1.392000000000003 | -4.613 | -3.041 | 8.271 |
| 1.394000000000003 | -4.612 | -3.049 | 8.231 |
| 1.396000000000003 | -4.61 | -3.057 | 8.191 |
| 1.398000000000003 | -4.609 | -3.064 | 8.152 |
| 1.400000000000003 | -4.608 | -3.072 | 8.112 |
| 1.402000000000003 | -4.607 | -3.08 | 8.073 |
| 1.404000000000003 | -4.605 | -3.087 | 8.033 |
| 1.406000000000003 | -4.604 | -3.095 | 7.994 |
| 1.408000000000003 | -4.603 | -3.102 | 7.955 |
| 1.410000000000003 | -4.601 | -3.11 | 7.916 |
| 1.412000000000003 | -4.6 | -3.117 | 7.877 |
| 1.414000000000003 | -4.598 | -3.124 | 7.838 |
| 1.416000000000003 | -4.597 | -3.131 | 7.799 |
| 1.418000000000003 | -4.595 | -3.138 | 7.76 |
| 1.420000000000003 | -4.593 | -3.145 | 7.721 |
| 1.422000000000003 | -4.592 | -3.152 | 7.683 |
| 1.424000000000003 | -4.59 | -3.159 | 7.644 |
| 1.426000000000003 | -4.588 | -3.166 | 7.606 |
| 1.428000000000003 | -4.587 | -3.173 | 7.568 |
| 1.430000000000003 | -4.585 | -3.18 | 7.53 |
| 1.432000000000003 | -4.583 | -3.186 | 7.491 |
| 1.434000000000003 | -4.581 | -3.193 | 7.453 |
| 1.436000000000003 | -4.579 | -3.199 | 7.416 |
| 1.438000000000003 | -4.577 | -3.206 | 7.378 |
| 1.440000000000003 | -4.575 | -3.212 | 7.34 |
| 1.442000000000003 | -4.573 | -3.219 | 7.302 |
| 1.444000000000003 | -4.571 | -3.225 | 7.265 |
| 1.446000000000003 | -4.569 | -3.231 | 7.227 |
| 1.448000000000003 | -4.567 | -3.237 | 7.19 |
| 1.450000000000003 | -4.565 | -3.243 | 7.153 |
| 1.452000000000003 | -4.563 | -3.249 | 7.116 |
| 1.454000000000003 | -4.56 | -3.255 | 7.078 |
| 1.456000000000003 | -4.558 | -3.261 | 7.041 |
| 1.458000000000003 | -4.556 | -3.267 | 7.005 |
| 1.460000000000003 | -4.553 | -3.273 | 6.968 |
| 1.462000000000003 | -4.551 | -3.279 | 6.931 |
| 1.464000000000003 | -4.549 | -3.284 | 6.894 |
| 1.466000000000003 | -4.546 | -3.29 | 6.858 |
| 1.468000000000003 | -4.544 | -3.295 | 6.821 |
| 1.470000000000003 | -4.541 | -3.301 | 6.785 |
| 1.472000000000003 | -4.539 | -3.306 | 6.749 |
| 1.474000000000003 | -4.536 | -3.311 | 6.712 |
| 1.476000000000003 | -4.534 | -3.317 | 6.676 |
| 1.478000000000003 | -4.531 | -3.322 | 6.64 |
| 1.480000000000003 | -4.528 | -3.327 | 6.604 |
| 1.482000000000003 | -4.526 | -3.332 | 6.569 |
| 1.484000000000003 | -4.523 | -3.337 | 6.533 |
| 1.486000000000003 | -4.52 | -3.342 | 6.497 |
| 1.488000000000003 | -4.517 | -3.347 | 6.462 |
| 1.490000000000003 | -4.515 | -3.352 | 6.426 |
| 1.492000000000003 | -4.512 | -3.357 | 6.391 |
| 1.494000000000003 | -4.509 | -3.361 | 6.355 |
| 1.496000000000003 | -4.506 | -3.366 | 6.32 |
| 1.498000000000003 | -4.503 | -3.37 | 6.285 |
| 1.500000000000003 | -4.5 | -3.375 | 6.25 |
| 1.502000000000003 | -4.497 | -3.379 | 6.215 |
| 1.504000000000003 | -4.494 | -3.384 | 6.18 |
| 1.506000000000003 | -4.491 | -3.388 | 6.145 |
| 1.508000000000003 | -4.488 | -3.393 | 6.111 |
| 1.510000000000003 | -4.485 | -3.397 | 6.076 |
| 1.512000000000003 | -4.481 | -3.401 | 6.042 |
| 1.514000000000003 | -4.478 | -3.405 | 6.007 |
| 1.516000000000003 | -4.475 | -3.409 | 5.973 |
| 1.518000000000003 | -4.472 | -3.413 | 5.939 |
| 1.520000000000003 | -4.468 | -3.417 | 5.904 |
| 1.522000000000003 | -4.465 | -3.421 | 5.87 |
| 1.524000000000003 | -4.462 | -3.425 | 5.836 |
| 1.526000000000003 | -4.458 | -3.428 | 5.802 |
| 1.528000000000003 | -4.455 | -3.432 | 5.769 |
| 1.530000000000003 | -4.451 | -3.436 | 5.735 |
| 1.532000000000003 | -4.448 | -3.439 | 5.701 |
| 1.534000000000003 | -4.444 | -3.443 | 5.668 |
| 1.536000000000003 | -4.441 | -3.446 | 5.634 |
| 1.538000000000003 | -4.437 | -3.45 | 5.601 |
| 1.540000000000003 | -4.434 | -3.453 | 5.567 |
| 1.542000000000003 | -4.43 | -3.456 | 5.534 |
| 1.544000000000003 | -4.426 | -3.46 | 5.501 |
| 1.546000000000003 | -4.423 | -3.463 | 5.468 |
| 1.548000000000003 | -4.419 | -3.466 | 5.435 |
| 1.550000000000003 | -4.415 | -3.469 | 5.402 |
| 1.552000000000003 | -4.411 | -3.472 | 5.369 |
| 1.554000000000003 | -4.408 | -3.475 | 5.337 |
| 1.556000000000003 | -4.404 | -3.478 | 5.304 |
| 1.558000000000003 | -4.4 | -3.481 | 5.272 |
| 1.560000000000003 | -4.396 | -3.484 | 5.239 |
| 1.562000000000003 | -4.392 | -3.486 | 5.207 |
| 1.564000000000003 | -4.388 | -3.489 | 5.175 |
| 1.566000000000003 | -4.384 | -3.492 | 5.142 |
| 1.568000000000003 | -4.38 | -3.494 | 5.11 |
| 1.570000000000003 | -4.376 | -3.497 | 5.078 |
| 1.572000000000003 | -4.372 | -3.499 | 5.046 |
| 1.574000000000003 | -4.368 | -3.502 | 5.014 |
| 1.576000000000003 | -4.364 | -3.504 | 4.983 |
| 1.578000000000003 | -4.36 | -3.506 | 4.951 |
| 1.580000000000003 | -4.355 | -3.509 | 4.919 |
| 1.582000000000003 | -4.351 | -3.511 | 4.888 |
| 1.584000000000003 | -4.347 | -3.513 | 4.856 |
| 1.586000000000003 | -4.343 | -3.515 | 4.825 |
| 1.588000000000003 | -4.338 | -3.517 | 4.794 |
| 1.590000000000003 | -4.334 | -3.519 | 4.763 |
| 1.592000000000003 | -4.33 | -3.521 | 4.732 |
| 1.594000000000003 | -4.325 | -3.523 | 4.701 |
| 1.596000000000003 | -4.321 | -3.525 | 4.67 |
| 1.598000000000003 | -4.316 | -3.526 | 4.639 |
| 1.600000000000003 | -4.312 | -3.528 | 4.608 |
| 1.602000000000003 | -4.308 | -3.53 | 4.577 |
| 1.604000000000003 | -4.303 | -3.531 | 4.547 |
| 1.606000000000003 | -4.298 | -3.533 | 4.516 |
| 1.608000000000003 | -4.294 | -3.534 | 4.486 |
| 1.610000000000003 | -4.289 | -3.536 | 4.455 |
| 1.612000000000003 | -4.285 | -3.537 | 4.425 |
| 1.614000000000003 | -4.28 | -3.538 | 4.395 |
| 1.616000000000003 | -4.275 | -3.54 | 4.365 |
| 1.618000000000003 | -4.271 | -3.541 | 4.335 |
| 1.620000000000003 | -4.266 | -3.542 | 4.305 |
| 1.622000000000003 | -4.261 | -3.543 | 4.275 |
| 1.624000000000003 | -4.256 | -3.544 | 4.245 |
| 1.626000000000003 | -4.251 | -3.545 | 4.216 |
| 1.628000000000003 | -4.247 | -3.546 | 4.186 |
| 1.630000000000003 | -4.242 | -3.547 | 4.157 |
| 1.632000000000003 | -4.237 | -3.548 | 4.127 |
| 1.634000000000003 | -4.232 | -3.549 | 4.098 |
| 1.636000000000003 | -4.227 | -3.55 | 4.068 |
| 1.638000000000003 | -4.222 | -3.551 | 4.039 |
| 1.640000000000003 | -4.217 | -3.551 | 4.01 |
| 1.642000000000003 | -4.212 | -3.552 | 3.981 |
| 1.644000000000003 | -4.207 | -3.552 | 3.952 |
| 1.646000000000003 | -4.202 | -3.553 | 3.923 |
| 1.648000000000003 | -4.197 | -3.553 | 3.894 |
| 1.650000000000003 | -4.192 | -3.554 | 3.866 |
| 1.652000000000003 | -4.187 | -3.554 | 3.837 |
| 1.654000000000003 | -4.181 | -3.555 | 3.809 |
| 1.656000000000003 | -4.176 | -3.555 | 3.78 |
| 1.658000000000003 | -4.171 | -3.555 | 3.752 |
| 1.660000000000003 | -4.166 | -3.555 | 3.723 |
| 1.662000000000003 | -4.161 | -3.555 | 3.695 |
| 1.664000000000003 | -4.155 | -3.556 | 3.667 |
| 1.666000000000003 | -4.15 | -3.556 | 3.639 |
| 1.668000000000003 | -4.145 | -3.556 | 3.611 |
| 1.670000000000003 | -4.139 | -3.555 | 3.583 |
| 1.672000000000003 | -4.134 | -3.555 | 3.555 |
| 1.674000000000003 | -4.128 | -3.555 | 3.527 |
| 1.676000000000003 | -4.123 | -3.555 | 3.5 |
| 1.678000000000003 | -4.118 | -3.555 | 3.472 |
| 1.680000000000003 | -4.112 | -3.554 | 3.445 |
| 1.682000000000003 | -4.107 | -3.554 | 3.417 |
| 1.684000000000003 | -4.101 | -3.554 | 3.39 |
| 1.686000000000003 | -4.095 | -3.553 | 3.363 |
| 1.688000000000003 | -4.09 | -3.553 | 3.335 |
| 1.690000000000003 | -4.084 | -3.552 | 3.308 |
| 1.692000000000003 | -4.079 | -3.552 | 3.281 |
| 1.694000000000003 | -4.073 | -3.551 | 3.254 |
| 1.696000000000003 | -4.067 | -3.55 | 3.228 |
| 1.698000000000003 | -4.062 | -3.55 | 3.201 |
| 1.700000000000003 | -4.056 | -3.549 | 3.174 |
| 1.702000000000003 | -4.05 | -3.548 | 3.147 |
| 1.704000000000003 | -4.045 | -3.547 | 3.121 |
| 1.706000000000003 | -4.039 | -3.546 | 3.094 |
| 1.708000000000003 | -4.033 | -3.546 | 3.068 |
| 1.710000000000003 | -4.027 | -3.545 | 3.042 |
| 1.712000000000003 | -4.021 | -3.544 | 3.015 |
| 1.714000000000003 | -4.015 | -3.542 | 2.989 |
| 1.716000000000003 | -4.01 | -3.541 | 2.963 |
| 1.718000000000003 | -4.004 | -3.54 | 2.937 |
| 1.720000000000003 | -3.998 | -3.539 | 2.911 |
| 1.722000000000003 | -3.992 | -3.538 | 2.885 |
| 1.724000000000003 | -3.986 | -3.536 | 2.859 |
| 1.726000000000003 | -3.98 | -3.535 | 2.834 |
| 1.728000000000003 | -3.974 | -3.534 | 2.808 |
| 1.730000000000003 | -3.968 | -3.532 | 2.783 |
| 1.732000000000003 | -3.962 | -3.531 | 2.757 |
| 1.734000000000003 | -3.956 | -3.529 | 2.732 |
| 1.736000000000003 | -3.95 | -3.528 | 2.706 |
| 1.738000000000003 | -3.943 | -3.526 | 2.681 |
| 1.740000000000003 | -3.937 | -3.524 | 2.656 |
| 1.742000000000003 | -3.931 | -3.523 | 2.631 |
| 1.744000000000003 | -3.925 | -3.521 | 2.606 |
| 1.746000000000003 | -3.919 | -3.519 | 2.581 |
| 1.748000000000003 | -3.912 | -3.517 | 2.556 |
| 1.750000000000003 | -3.906 | -3.516 | 2.531 |
| 1.752000000000003 | -3.9 | -3.514 | 2.507 |
| 1.754000000000003 | -3.894 | -3.512 | 2.482 |
| 1.756000000000003 | -3.887 | -3.51 | 2.457 |
| 1.758000000000003 | -3.881 | -3.508 | 2.433 |
| 1.760000000000003 | -3.875 | -3.506 | 2.408 |
| 1.762000000000003 | -3.868 | -3.504 | 2.384 |
| 1.764000000000003 | -3.862 | -3.501 | 2.36 |
| 1.766000000000003 | -3.856 | -3.499 | 2.336 |
| 1.768000000000003 | -3.849 | -3.497 | 2.312 |
| 1.770000000000003 | -3.843 | -3.495 | 2.288 |
| 1.772000000000003 | -3.836 | -3.492 | 2.264 |
| 1.774000000000003 | -3.83 | -3.49 | 2.24 |
| 1.776000000000003 | -3.823 | -3.488 | 2.216 |
| 1.778000000000003 | -3.817 | -3.485 | 2.192 |
| 1.780000000000003 | -3.81 | -3.483 | 2.168 |
| 1.782000000000003 | -3.804 | -3.48 | 2.145 |
| 1.784000000000003 | -3.797 | -3.478 | 2.121 |
| 1.786000000000003 | -3.791 | -3.475 | 2.098 |
| 1.788000000000003 | -3.784 | -3.473 | 2.075 |
| 1.790000000000003 | -3.777 | -3.47 | 2.051 |
| 1.792000000000003 | -3.771 | -3.467 | 2.028 |
| 1.794000000000003 | -3.764 | -3.464 | 2.005 |
| 1.796000000000003 | -3.757 | -3.462 | 1.982 |
| 1.798000000000003 | -3.751 | -3.459 | 1.959 |
| 1.800000000000003 | -3.744 | -3.456 | 1.936 |
| 1.802000000000003 | -3.737 | -3.453 | 1.913 |
| 1.804000000000003 | -3.731 | -3.45 | 1.89 |
| 1.806000000000003 | -3.724 | -3.447 | 1.868 |
| 1.808000000000003 | -3.717 | -3.444 | 1.845 |
| 1.810000000000003 | -3.71 | -3.441 | 1.823 |
| 1.812000000000003 | -3.703 | -3.438 | 1.8 |
| 1.814000000000003 | -3.697 | -3.435 | 1.778 |
| 1.816000000000003 | -3.69 | -3.432 | 1.755 |
| 1.818000000000003 | -3.683 | -3.429 | 1.733 |
| 1.820000000000003 | -3.676 | -3.425 | 1.711 |
| 1.822000000000003 | -3.669 | -3.422 | 1.689 |
| 1.824000000000003 | -3.662 | -3.419 | 1.667 |
| 1.826000000000003 | -3.655 | -3.415 | 1.645 |
| 1.828000000000003 | -3.648 | -3.412 | 1.623 |
| 1.830000000000003 | -3.641 | -3.409 | 1.601 |
| 1.832000000000003 | -3.634 | -3.405 | 1.579 |
| 1.834000000000003 | -3.627 | -3.402 | 1.558 |
| 1.836000000000003 | -3.62 | -3.398 | 1.536 |
| 1.838000000000003 | -3.613 | -3.395 | 1.514 |
| 1.840000000000003 | -3.606 | -3.391 | 1.493 |
| 1.842000000000003 | -3.599 | -3.387 | 1.472 |
| 1.844000000000003 | -3.592 | -3.384 | 1.45 |
| 1.846000000000003 | -3.585 | -3.38 | 1.429 |
| 1.848000000000003 | -3.578 | -3.376 | 1.408 |
| 1.850000000000003 | -3.571 | -3.372 | 1.387 |
| 1.852000000000003 | -3.564 | -3.369 | 1.366 |
| 1.854000000000003 | -3.556 | -3.365 | 1.345 |
| 1.856000000000003 | -3.549 | -3.361 | 1.324 |
| 1.858000000000003 | -3.542 | -3.357 | 1.303 |
| 1.860000000000003 | -3.535 | -3.353 | 1.282 |
| 1.862000000000003 | -3.528 | -3.349 | 1.262 |
| 1.864000000000003 | -3.52 | -3.345 | 1.241 |
| 1.866000000000003 | -3.513 | -3.341 | 1.22 |
| 1.868000000000003 | -3.506 | -3.337 | 1.2 |
| 1.870000000000003 | -3.499 | -3.333 | 1.18 |
| 1.872000000000003 | -3.491 | -3.329 | 1.159 |
| 1.874000000000003 | -3.484 | -3.324 | 1.139 |
| 1.876000000000003 | -3.477 | -3.32 | 1.119 |
| 1.878000000000003 | -3.469 | -3.316 | 1.099 |
| 1.880000000000003 | -3.462 | -3.312 | 1.079 |
| 1.882000000000003 | -3.455 | -3.307 | 1.059 |
| 1.884000000000003 | -3.447 | -3.303 | 1.039 |
| 1.886000000000003 | -3.44 | -3.299 | 1.019 |
| 1.888000000000003 | -3.433 | -3.294 | 0.999 |
| 1.890000000000003 | -3.425 | -3.29 | 0.979 |
| 1.892000000000003 | -3.418 | -3.285 | 0.96 |
| 1.894000000000003 | -3.41 | -3.281 | 0.94 |
| 1.896000000000003 | -3.403 | -3.276 | 0.921 |
| 1.898000000000003 | -3.395 | -3.272 | 0.901 |
| 1.900000000000003 | -3.388 | -3.267 | 0.882 |
| 1.902000000000003 | -3.381 | -3.262 | 0.863 |
| 1.904000000000003 | -3.373 | -3.258 | 0.843 |
| 1.906000000000003 | -3.366 | -3.253 | 0.824 |
| 1.908000000000003 | -3.358 | -3.248 | 0.805 |
| 1.910000000000003 | -3.35 | -3.244 | 0.786 |
| 1.912000000000003 | -3.343 | -3.239 | 0.767 |
| 1.914000000000003 | -3.335 | -3.234 | 0.748 |
| 1.916000000000003 | -3.328 | -3.229 | 0.73 |
| 1.918000000000003 | -3.32 | -3.224 | 0.711 |
| 1.920000000000003 | -3.313 | -3.219 | 0.692 |
| 1.922000000000003 | -3.305 | -3.214 | 0.674 |
| 1.924000000000003 | -3.297 | -3.209 | 0.655 |
| 1.926000000000003 | -3.29 | -3.204 | 0.637 |
| 1.928000000000003 | -3.282 | -3.199 | 0.618 |
| 1.930000000000003 | -3.274 | -3.194 | 0.6 |
| 1.932000000000003 | -3.267 | -3.189 | 0.582 |
| 1.934000000000003 | -3.259 | -3.184 | 0.563 |
| 1.936000000000003 | -3.251 | -3.179 | 0.545 |
| 1.938000000000003 | -3.244 | -3.174 | 0.527 |
| 1.940000000000003 | -3.236 | -3.169 | 0.509 |
| 1.942000000000003 | -3.228 | -3.163 | 0.491 |
| 1.944000000000003 | -3.221 | -3.158 | 0.473 |
| 1.946000000000003 | -3.213 | -3.153 | 0.456 |
| 1.948000000000003 | -3.205 | -3.147 | 0.438 |
| 1.950000000000003 | -3.197 | -3.142 | 0.42 |
| 1.952000000000003 | -3.189 | -3.137 | 0.403 |
| 1.954000000000003 | -3.182 | -3.131 | 0.385 |
| 1.956000000000003 | -3.174 | -3.126 | 0.368 |
| 1.958000000000003 | -3.166 | -3.12 | 0.35 |
| 1.960000000000003 | -3.158 | -3.115 | 0.333 |
| 1.962000000000003 | -3.15 | -3.11 | 0.316 |
| 1.964000000000003 | -3.143 | -3.104 | 0.298 |
| 1.966000000000003 | -3.135 | -3.098 | 0.281 |
| 1.968000000000003 | -3.127 | -3.093 | 0.264 |
| 1.970000000000003 | -3.119 | -3.087 | 0.247 |
| 1.972000000000003 | -3.111 | -3.082 | 0.23 |
| 1.974000000000003 | -3.103 | -3.076 | 0.213 |
| 1.976000000000003 | -3.095 | -3.07 | 0.197 |
| 1.978000000000003 | -3.087 | -3.065 | 0.18 |
| 1.980000000000003 | -3.08 | -3.059 | 0.163 |
| 1.982000000000003 | -3.072 | -3.053 | 0.147 |
| 1.984000000000003 | -3.064 | -3.047 | 0.13 |
| 1.986000000000003 | -3.056 | -3.041 | 0.114 |
| 1.988000000000003 | -3.048 | -3.036 | 0.097 |
| 1.990000000000003 | -3.04 | -3.03 | 0.081 |
| 1.992000000000003 | -3.032 | -3.024 | 0.065 |
| 1.994000000000003 | -3.024 | -3.018 | 0.048 |
| 1.996000000000003 | -3.016 | -3.012 | 0.032 |
| 1.998000000000003 | -3.008 | -3.006 | 0.016 |
| 2.000000000000003 | -3 | -3 | 0 |